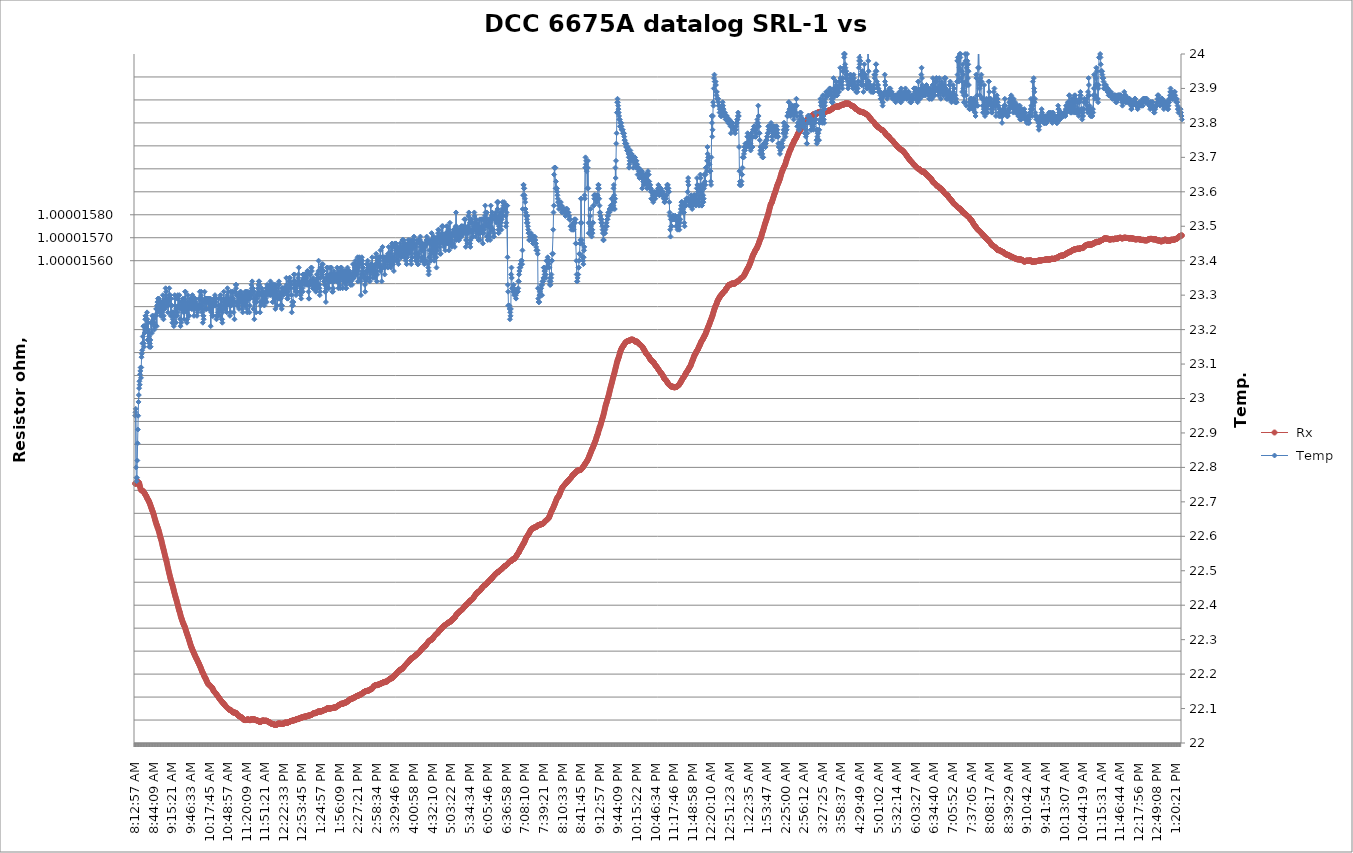
| Category |  Rx |
|---|---|
| 2021-03-12 08:12:57 | 1 |
| 2021-03-12 08:13:28 | 1 |
| 2021-03-12 08:13:58 | 1 |
| 2021-03-12 08:14:29 | 1 |
| 2021-03-12 08:15:00 | 1 |
| 2021-03-12 08:15:30 | 1 |
| 2021-03-12 08:16:01 | 1 |
| 2021-03-12 08:16:32 | 1 |
| 2021-03-12 08:17:02 | 1 |
| 2021-03-12 08:17:33 | 1 |
| 2021-03-12 08:18:04 | 1 |
| 2021-03-12 08:18:35 | 1 |
| 2021-03-12 08:19:05 | 1 |
| 2021-03-12 08:19:36 | 1 |
| 2021-03-12 08:20:07 | 1 |
| 2021-03-12 08:20:37 | 1 |
| 2021-03-12 08:21:08 | 1 |
| 2021-03-12 08:21:39 | 1 |
| 2021-03-12 08:22:09 | 1 |
| 2021-03-12 08:22:40 | 1 |
| 2021-03-12 08:23:11 | 1 |
| 2021-03-12 08:23:41 | 1 |
| 2021-03-12 08:24:12 | 1 |
| 2021-03-12 08:24:43 | 1 |
| 2021-03-12 08:25:13 | 1 |
| 2021-03-12 08:25:44 | 1 |
| 2021-03-12 08:26:15 | 1 |
| 2021-03-12 08:26:46 | 1 |
| 2021-03-12 08:27:16 | 1 |
| 2021-03-12 08:27:47 | 1 |
| 2021-03-12 08:28:18 | 1 |
| 2021-03-12 08:28:48 | 1 |
| 2021-03-12 08:29:19 | 1 |
| 2021-03-12 08:29:50 | 1 |
| 2021-03-12 08:30:20 | 1 |
| 2021-03-12 08:30:51 | 1 |
| 2021-03-12 08:31:22 | 1 |
| 2021-03-12 08:31:52 | 1 |
| 2021-03-12 08:32:23 | 1 |
| 2021-03-12 08:32:54 | 1 |
| 2021-03-12 08:33:25 | 1 |
| 2021-03-12 08:33:55 | 1 |
| 2021-03-12 08:34:26 | 1 |
| 2021-03-12 08:34:57 | 1 |
| 2021-03-12 08:35:27 | 1 |
| 2021-03-12 08:35:58 | 1 |
| 2021-03-12 08:36:29 | 1 |
| 2021-03-12 08:36:59 | 1 |
| 2021-03-12 08:37:30 | 1 |
| 2021-03-12 08:38:01 | 1 |
| 2021-03-12 08:38:31 | 1 |
| 2021-03-12 08:39:02 | 1 |
| 2021-03-12 08:39:33 | 1 |
| 2021-03-12 08:40:03 | 1 |
| 2021-03-12 08:40:34 | 1 |
| 2021-03-12 08:41:05 | 1 |
| 2021-03-12 08:41:36 | 1 |
| 2021-03-12 08:42:06 | 1 |
| 2021-03-12 08:42:37 | 1 |
| 2021-03-12 08:43:08 | 1 |
| 2021-03-12 08:43:38 | 1 |
| 2021-03-12 08:44:09 | 1 |
| 2021-03-12 08:44:40 | 1 |
| 2021-03-12 08:45:10 | 1 |
| 2021-03-12 08:45:41 | 1 |
| 2021-03-12 08:46:12 | 1 |
| 2021-03-12 08:46:42 | 1 |
| 2021-03-12 08:47:13 | 1 |
| 2021-03-12 08:47:44 | 1 |
| 2021-03-12 08:48:14 | 1 |
| 2021-03-12 08:48:45 | 1 |
| 2021-03-12 08:49:16 | 1 |
| 2021-03-12 08:49:47 | 1 |
| 2021-03-12 08:50:17 | 1 |
| 2021-03-12 08:50:48 | 1 |
| 2021-03-12 08:51:19 | 1 |
| 2021-03-12 08:51:49 | 1 |
| 2021-03-12 08:52:20 | 1 |
| 2021-03-12 08:52:51 | 1 |
| 2021-03-12 08:53:21 | 1 |
| 2021-03-12 08:53:52 | 1 |
| 2021-03-12 08:54:23 | 1 |
| 2021-03-12 08:54:53 | 1 |
| 2021-03-12 08:55:24 | 1 |
| 2021-03-12 08:55:55 | 1 |
| 2021-03-12 08:56:25 | 1 |
| 2021-03-12 08:56:56 | 1 |
| 2021-03-12 08:57:27 | 1 |
| 2021-03-12 08:57:57 | 1 |
| 2021-03-12 08:58:28 | 1 |
| 2021-03-12 08:58:59 | 1 |
| 2021-03-12 08:59:30 | 1 |
| 2021-03-12 09:00:00 | 1 |
| 2021-03-12 09:00:31 | 1 |
| 2021-03-12 09:01:02 | 1 |
| 2021-03-12 09:01:32 | 1 |
| 2021-03-12 09:02:03 | 1 |
| 2021-03-12 09:02:34 | 1 |
| 2021-03-12 09:03:04 | 1 |
| 2021-03-12 09:03:35 | 1 |
| 2021-03-12 09:04:06 | 1 |
| 2021-03-12 09:04:36 | 1 |
| 2021-03-12 09:05:07 | 1 |
| 2021-03-12 09:05:38 | 1 |
| 2021-03-12 09:06:08 | 1 |
| 2021-03-12 09:06:39 | 1 |
| 2021-03-12 09:07:10 | 1 |
| 2021-03-12 09:07:41 | 1 |
| 2021-03-12 09:08:11 | 1 |
| 2021-03-12 09:08:42 | 1 |
| 2021-03-12 09:09:13 | 1 |
| 2021-03-12 09:09:43 | 1 |
| 2021-03-12 09:10:14 | 1 |
| 2021-03-12 09:10:45 | 1 |
| 2021-03-12 09:11:15 | 1 |
| 2021-03-12 09:11:46 | 1 |
| 2021-03-12 09:12:17 | 1 |
| 2021-03-12 09:12:47 | 1 |
| 2021-03-12 09:13:18 | 1 |
| 2021-03-12 09:13:49 | 1 |
| 2021-03-12 09:14:19 | 1 |
| 2021-03-12 09:14:50 | 1 |
| 2021-03-12 09:15:21 | 1 |
| 2021-03-12 09:15:52 | 1 |
| 2021-03-12 09:16:22 | 1 |
| 2021-03-12 09:16:53 | 1 |
| 2021-03-12 09:17:24 | 1 |
| 2021-03-12 09:17:54 | 1 |
| 2021-03-12 09:18:25 | 1 |
| 2021-03-12 09:18:56 | 1 |
| 2021-03-12 09:19:26 | 1 |
| 2021-03-12 09:19:57 | 1 |
| 2021-03-12 09:20:28 | 1 |
| 2021-03-12 09:20:58 | 1 |
| 2021-03-12 09:21:29 | 1 |
| 2021-03-12 09:22:00 | 1 |
| 2021-03-12 09:22:31 | 1 |
| 2021-03-12 09:23:01 | 1 |
| 2021-03-12 09:23:32 | 1 |
| 2021-03-12 09:24:03 | 1 |
| 2021-03-12 09:24:33 | 1 |
| 2021-03-12 09:25:04 | 1 |
| 2021-03-12 09:25:35 | 1 |
| 2021-03-12 09:26:05 | 1 |
| 2021-03-12 09:26:36 | 1 |
| 2021-03-12 09:27:07 | 1 |
| 2021-03-12 09:27:37 | 1 |
| 2021-03-12 09:28:08 | 1 |
| 2021-03-12 09:28:39 | 1 |
| 2021-03-12 09:29:10 | 1 |
| 2021-03-12 09:29:40 | 1 |
| 2021-03-12 09:30:11 | 1 |
| 2021-03-12 09:30:42 | 1 |
| 2021-03-12 09:31:12 | 1 |
| 2021-03-12 09:31:43 | 1 |
| 2021-03-12 09:32:14 | 1 |
| 2021-03-12 09:32:44 | 1 |
| 2021-03-12 09:33:15 | 1 |
| 2021-03-12 09:33:46 | 1 |
| 2021-03-12 09:34:16 | 1 |
| 2021-03-12 09:34:47 | 1 |
| 2021-03-12 09:35:18 | 1 |
| 2021-03-12 09:35:49 | 1 |
| 2021-03-12 09:36:19 | 1 |
| 2021-03-12 09:36:50 | 1 |
| 2021-03-12 09:37:21 | 1 |
| 2021-03-12 09:37:51 | 1 |
| 2021-03-12 09:38:22 | 1 |
| 2021-03-12 09:38:53 | 1 |
| 2021-03-12 09:39:23 | 1 |
| 2021-03-12 09:39:54 | 1 |
| 2021-03-12 09:40:25 | 1 |
| 2021-03-12 09:40:55 | 1 |
| 2021-03-12 09:41:26 | 1 |
| 2021-03-12 09:41:57 | 1 |
| 2021-03-12 09:42:27 | 1 |
| 2021-03-12 09:42:58 | 1 |
| 2021-03-12 09:43:29 | 1 |
| 2021-03-12 09:44:00 | 1 |
| 2021-03-12 09:44:30 | 1 |
| 2021-03-12 09:45:01 | 1 |
| 2021-03-12 09:45:32 | 1 |
| 2021-03-12 09:46:02 | 1 |
| 2021-03-12 09:46:33 | 1 |
| 2021-03-12 09:47:04 | 1 |
| 2021-03-12 09:47:34 | 1 |
| 2021-03-12 09:48:05 | 1 |
| 2021-03-12 09:48:36 | 1 |
| 2021-03-12 09:49:06 | 1 |
| 2021-03-12 09:49:37 | 1 |
| 2021-03-12 09:50:08 | 1 |
| 2021-03-12 09:50:38 | 1 |
| 2021-03-12 09:51:09 | 1 |
| 2021-03-12 09:51:40 | 1 |
| 2021-03-12 09:52:11 | 1 |
| 2021-03-12 09:52:41 | 1 |
| 2021-03-12 09:53:12 | 1 |
| 2021-03-12 09:53:43 | 1 |
| 2021-03-12 09:54:13 | 1 |
| 2021-03-12 09:54:44 | 1 |
| 2021-03-12 09:55:15 | 1 |
| 2021-03-12 09:55:45 | 1 |
| 2021-03-12 09:56:16 | 1 |
| 2021-03-12 09:56:47 | 1 |
| 2021-03-12 09:57:17 | 1 |
| 2021-03-12 09:57:48 | 1 |
| 2021-03-12 09:58:19 | 1 |
| 2021-03-12 09:58:49 | 1 |
| 2021-03-12 09:59:20 | 1 |
| 2021-03-12 09:59:51 | 1 |
| 2021-03-12 10:00:22 | 1 |
| 2021-03-12 10:00:52 | 1 |
| 2021-03-12 10:01:23 | 1 |
| 2021-03-12 10:01:54 | 1 |
| 2021-03-12 10:02:24 | 1 |
| 2021-03-12 10:02:55 | 1 |
| 2021-03-12 10:03:26 | 1 |
| 2021-03-12 10:03:56 | 1 |
| 2021-03-12 10:04:27 | 1 |
| 2021-03-12 10:04:58 | 1 |
| 2021-03-12 10:05:28 | 1 |
| 2021-03-12 10:05:59 | 1 |
| 2021-03-12 10:06:30 | 1 |
| 2021-03-12 10:07:00 | 1 |
| 2021-03-12 10:07:31 | 1 |
| 2021-03-12 10:08:02 | 1 |
| 2021-03-12 10:08:33 | 1 |
| 2021-03-12 10:09:03 | 1 |
| 2021-03-12 10:09:34 | 1 |
| 2021-03-12 10:10:05 | 1 |
| 2021-03-12 10:10:35 | 1 |
| 2021-03-12 10:11:06 | 1 |
| 2021-03-12 10:11:37 | 1 |
| 2021-03-12 10:12:07 | 1 |
| 2021-03-12 10:12:38 | 1 |
| 2021-03-12 10:13:09 | 1 |
| 2021-03-12 10:13:39 | 1 |
| 2021-03-12 10:14:10 | 1 |
| 2021-03-12 10:14:41 | 1 |
| 2021-03-12 10:15:12 | 1 |
| 2021-03-12 10:15:42 | 1 |
| 2021-03-12 10:16:13 | 1 |
| 2021-03-12 10:16:44 | 1 |
| 2021-03-12 10:17:14 | 1 |
| 2021-03-12 10:17:45 | 1 |
| 2021-03-12 10:18:16 | 1 |
| 2021-03-12 10:18:46 | 1 |
| 2021-03-12 10:19:17 | 1 |
| 2021-03-12 10:19:48 | 1 |
| 2021-03-12 10:20:18 | 1 |
| 2021-03-12 10:20:49 | 1 |
| 2021-03-12 10:21:20 | 1 |
| 2021-03-12 10:21:51 | 1 |
| 2021-03-12 10:22:21 | 1 |
| 2021-03-12 10:22:52 | 1 |
| 2021-03-12 10:23:23 | 1 |
| 2021-03-12 10:23:53 | 1 |
| 2021-03-12 10:24:24 | 1 |
| 2021-03-12 10:24:55 | 1 |
| 2021-03-12 10:25:25 | 1 |
| 2021-03-12 10:25:56 | 1 |
| 2021-03-12 10:26:27 | 1 |
| 2021-03-12 10:26:57 | 1 |
| 2021-03-12 10:27:28 | 1 |
| 2021-03-12 10:27:59 | 1 |
| 2021-03-12 10:28:29 | 1 |
| 2021-03-12 10:29:00 | 1 |
| 2021-03-12 10:29:31 | 1 |
| 2021-03-12 10:30:02 | 1 |
| 2021-03-12 10:30:32 | 1 |
| 2021-03-12 10:31:03 | 1 |
| 2021-03-12 10:31:34 | 1 |
| 2021-03-12 10:32:04 | 1 |
| 2021-03-12 10:32:35 | 1 |
| 2021-03-12 10:33:06 | 1 |
| 2021-03-12 10:33:36 | 1 |
| 2021-03-12 10:34:07 | 1 |
| 2021-03-12 10:34:38 | 1 |
| 2021-03-12 10:35:08 | 1 |
| 2021-03-12 10:35:39 | 1 |
| 2021-03-12 10:36:10 | 1 |
| 2021-03-12 10:36:41 | 1 |
| 2021-03-12 10:37:11 | 1 |
| 2021-03-12 10:37:42 | 1 |
| 2021-03-12 10:38:13 | 1 |
| 2021-03-12 10:38:43 | 1 |
| 2021-03-12 10:39:14 | 1 |
| 2021-03-12 10:39:45 | 1 |
| 2021-03-12 10:40:15 | 1 |
| 2021-03-12 10:40:46 | 1 |
| 2021-03-12 10:41:17 | 1 |
| 2021-03-12 10:41:47 | 1 |
| 2021-03-12 10:42:18 | 1 |
| 2021-03-12 10:42:49 | 1 |
| 2021-03-12 10:43:19 | 1 |
| 2021-03-12 10:43:50 | 1 |
| 2021-03-12 10:44:21 | 1 |
| 2021-03-12 10:44:52 | 1 |
| 2021-03-12 10:45:22 | 1 |
| 2021-03-12 10:45:53 | 1 |
| 2021-03-12 10:46:24 | 1 |
| 2021-03-12 10:46:54 | 1 |
| 2021-03-12 10:47:25 | 1 |
| 2021-03-12 10:47:56 | 1 |
| 2021-03-12 10:48:26 | 1 |
| 2021-03-12 10:48:57 | 1 |
| 2021-03-12 10:49:28 | 1 |
| 2021-03-12 10:49:58 | 1 |
| 2021-03-12 10:50:29 | 1 |
| 2021-03-12 10:51:00 | 1 |
| 2021-03-12 10:51:30 | 1 |
| 2021-03-12 10:52:01 | 1 |
| 2021-03-12 10:52:32 | 1 |
| 2021-03-12 10:53:03 | 1 |
| 2021-03-12 10:53:33 | 1 |
| 2021-03-12 10:54:04 | 1 |
| 2021-03-12 10:54:35 | 1 |
| 2021-03-12 10:55:05 | 1 |
| 2021-03-12 10:55:36 | 1 |
| 2021-03-12 10:56:07 | 1 |
| 2021-03-12 10:56:37 | 1 |
| 2021-03-12 10:57:08 | 1 |
| 2021-03-12 10:57:39 | 1 |
| 2021-03-12 10:58:09 | 1 |
| 2021-03-12 10:58:40 | 1 |
| 2021-03-12 10:59:11 | 1 |
| 2021-03-12 10:59:41 | 1 |
| 2021-03-12 11:00:12 | 1 |
| 2021-03-12 11:00:43 | 1 |
| 2021-03-12 11:01:14 | 1 |
| 2021-03-12 11:01:44 | 1 |
| 2021-03-12 11:02:15 | 1 |
| 2021-03-12 11:02:46 | 1 |
| 2021-03-12 11:03:16 | 1 |
| 2021-03-12 11:03:47 | 1 |
| 2021-03-12 11:04:18 | 1 |
| 2021-03-12 11:04:48 | 1 |
| 2021-03-12 11:05:19 | 1 |
| 2021-03-12 11:05:50 | 1 |
| 2021-03-12 11:06:20 | 1 |
| 2021-03-12 11:06:51 | 1 |
| 2021-03-12 11:07:22 | 1 |
| 2021-03-12 11:07:53 | 1 |
| 2021-03-12 11:08:23 | 1 |
| 2021-03-12 11:08:54 | 1 |
| 2021-03-12 11:09:25 | 1 |
| 2021-03-12 11:09:55 | 1 |
| 2021-03-12 11:10:26 | 1 |
| 2021-03-12 11:10:57 | 1 |
| 2021-03-12 11:11:27 | 1 |
| 2021-03-12 11:11:58 | 1 |
| 2021-03-12 11:12:29 | 1 |
| 2021-03-12 11:12:59 | 1 |
| 2021-03-12 11:13:30 | 1 |
| 2021-03-12 11:14:01 | 1 |
| 2021-03-12 11:14:32 | 1 |
| 2021-03-12 11:15:02 | 1 |
| 2021-03-12 11:15:33 | 1 |
| 2021-03-12 11:16:04 | 1 |
| 2021-03-12 11:16:34 | 1 |
| 2021-03-12 11:17:05 | 1 |
| 2021-03-12 11:17:36 | 1 |
| 2021-03-12 11:18:06 | 1 |
| 2021-03-12 11:18:37 | 1 |
| 2021-03-12 11:19:08 | 1 |
| 2021-03-12 11:19:38 | 1 |
| 2021-03-12 11:20:09 | 1 |
| 2021-03-12 11:20:40 | 1 |
| 2021-03-12 11:21:10 | 1 |
| 2021-03-12 11:21:41 | 1 |
| 2021-03-12 11:22:12 | 1 |
| 2021-03-12 11:22:43 | 1 |
| 2021-03-12 11:23:13 | 1 |
| 2021-03-12 11:23:44 | 1 |
| 2021-03-12 11:24:15 | 1 |
| 2021-03-12 11:24:45 | 1 |
| 2021-03-12 11:25:16 | 1 |
| 2021-03-12 11:25:47 | 1 |
| 2021-03-12 11:26:17 | 1 |
| 2021-03-12 11:26:48 | 1 |
| 2021-03-12 11:27:19 | 1 |
| 2021-03-12 11:27:49 | 1 |
| 2021-03-12 11:28:20 | 1 |
| 2021-03-12 11:28:51 | 1 |
| 2021-03-12 11:29:21 | 1 |
| 2021-03-12 11:29:52 | 1 |
| 2021-03-12 11:30:23 | 1 |
| 2021-03-12 11:30:54 | 1 |
| 2021-03-12 11:31:24 | 1 |
| 2021-03-12 11:31:55 | 1 |
| 2021-03-12 11:32:26 | 1 |
| 2021-03-12 11:32:56 | 1 |
| 2021-03-12 11:33:27 | 1 |
| 2021-03-12 11:33:58 | 1 |
| 2021-03-12 11:34:28 | 1 |
| 2021-03-12 11:34:59 | 1 |
| 2021-03-12 11:35:30 | 1 |
| 2021-03-12 11:36:00 | 1 |
| 2021-03-12 11:36:31 | 1 |
| 2021-03-12 11:37:02 | 1 |
| 2021-03-12 11:37:33 | 1 |
| 2021-03-12 11:38:03 | 1 |
| 2021-03-12 11:38:34 | 1 |
| 2021-03-12 11:39:05 | 1 |
| 2021-03-12 11:39:35 | 1 |
| 2021-03-12 11:40:06 | 1 |
| 2021-03-12 11:40:37 | 1 |
| 2021-03-12 11:41:07 | 1 |
| 2021-03-12 11:41:38 | 1 |
| 2021-03-12 11:42:09 | 1 |
| 2021-03-12 11:42:39 | 1 |
| 2021-03-12 11:43:10 | 1 |
| 2021-03-12 11:43:41 | 1 |
| 2021-03-12 11:44:11 | 1 |
| 2021-03-12 11:44:42 | 1 |
| 2021-03-12 11:45:13 | 1 |
| 2021-03-12 11:45:44 | 1 |
| 2021-03-12 11:46:14 | 1 |
| 2021-03-12 11:46:45 | 1 |
| 2021-03-12 11:47:16 | 1 |
| 2021-03-12 11:47:46 | 1 |
| 2021-03-12 11:48:17 | 1 |
| 2021-03-12 11:48:48 | 1 |
| 2021-03-12 11:49:18 | 1 |
| 2021-03-12 11:49:49 | 1 |
| 2021-03-12 11:50:20 | 1 |
| 2021-03-12 11:50:50 | 1 |
| 2021-03-12 11:51:21 | 1 |
| 2021-03-12 11:51:52 | 1 |
| 2021-03-12 11:52:23 | 1 |
| 2021-03-12 11:52:53 | 1 |
| 2021-03-12 11:53:24 | 1 |
| 2021-03-12 11:53:55 | 1 |
| 2021-03-12 11:54:25 | 1 |
| 2021-03-12 11:54:56 | 1 |
| 2021-03-12 11:55:27 | 1 |
| 2021-03-12 11:55:57 | 1 |
| 2021-03-12 11:56:28 | 1 |
| 2021-03-12 11:56:59 | 1 |
| 2021-03-12 11:57:29 | 1 |
| 2021-03-12 11:58:00 | 1 |
| 2021-03-12 11:58:31 | 1 |
| 2021-03-12 11:59:01 | 1 |
| 2021-03-12 11:59:32 | 1 |
| 2021-03-12 12:00:03 | 1 |
| 2021-03-12 12:00:34 | 1 |
| 2021-03-12 12:01:04 | 1 |
| 2021-03-12 12:01:35 | 1 |
| 2021-03-12 12:02:06 | 1 |
| 2021-03-12 12:02:36 | 1 |
| 2021-03-12 12:03:07 | 1 |
| 2021-03-12 12:03:38 | 1 |
| 2021-03-12 12:04:08 | 1 |
| 2021-03-12 12:04:39 | 1 |
| 2021-03-12 12:05:10 | 1 |
| 2021-03-12 12:05:40 | 1 |
| 2021-03-12 12:06:11 | 1 |
| 2021-03-12 12:06:42 | 1 |
| 2021-03-12 12:07:13 | 1 |
| 2021-03-12 12:07:43 | 1 |
| 2021-03-12 12:08:14 | 1 |
| 2021-03-12 12:08:45 | 1 |
| 2021-03-12 12:09:15 | 1 |
| 2021-03-12 12:09:46 | 1 |
| 2021-03-12 12:10:17 | 1 |
| 2021-03-12 12:10:47 | 1 |
| 2021-03-12 12:11:18 | 1 |
| 2021-03-12 12:11:49 | 1 |
| 2021-03-12 12:12:19 | 1 |
| 2021-03-12 12:12:50 | 1 |
| 2021-03-12 12:13:21 | 1 |
| 2021-03-12 12:13:51 | 1 |
| 2021-03-12 12:14:22 | 1 |
| 2021-03-12 12:14:53 | 1 |
| 2021-03-12 12:15:24 | 1 |
| 2021-03-12 12:15:54 | 1 |
| 2021-03-12 12:16:25 | 1 |
| 2021-03-12 12:16:56 | 1 |
| 2021-03-12 12:17:26 | 1 |
| 2021-03-12 12:17:57 | 1 |
| 2021-03-12 12:18:28 | 1 |
| 2021-03-12 12:18:58 | 1 |
| 2021-03-12 12:19:29 | 1 |
| 2021-03-12 12:20:00 | 1 |
| 2021-03-12 12:20:30 | 1 |
| 2021-03-12 12:21:01 | 1 |
| 2021-03-12 12:21:32 | 1 |
| 2021-03-12 12:22:02 | 1 |
| 2021-03-12 12:22:33 | 1 |
| 2021-03-12 12:23:04 | 1 |
| 2021-03-12 12:23:35 | 1 |
| 2021-03-12 12:24:05 | 1 |
| 2021-03-12 12:24:36 | 1 |
| 2021-03-12 12:25:07 | 1 |
| 2021-03-12 12:25:37 | 1 |
| 2021-03-12 12:26:08 | 1 |
| 2021-03-12 12:26:39 | 1 |
| 2021-03-12 12:27:09 | 1 |
| 2021-03-12 12:27:40 | 1 |
| 2021-03-12 12:28:11 | 1 |
| 2021-03-12 12:28:41 | 1 |
| 2021-03-12 12:29:12 | 1 |
| 2021-03-12 12:29:43 | 1 |
| 2021-03-12 12:30:14 | 1 |
| 2021-03-12 12:30:44 | 1 |
| 2021-03-12 12:31:15 | 1 |
| 2021-03-12 12:31:46 | 1 |
| 2021-03-12 12:32:16 | 1 |
| 2021-03-12 12:32:47 | 1 |
| 2021-03-12 12:33:18 | 1 |
| 2021-03-12 12:33:48 | 1 |
| 2021-03-12 12:34:19 | 1 |
| 2021-03-12 12:34:50 | 1 |
| 2021-03-12 12:35:20 | 1 |
| 2021-03-12 12:35:51 | 1 |
| 2021-03-12 12:36:22 | 1 |
| 2021-03-12 12:36:53 | 1 |
| 2021-03-12 12:37:23 | 1 |
| 2021-03-12 12:37:54 | 1 |
| 2021-03-12 12:38:25 | 1 |
| 2021-03-12 12:38:55 | 1 |
| 2021-03-12 12:39:26 | 1 |
| 2021-03-12 12:39:57 | 1 |
| 2021-03-12 12:40:27 | 1 |
| 2021-03-12 12:40:58 | 1 |
| 2021-03-12 12:41:29 | 1 |
| 2021-03-12 12:41:59 | 1 |
| 2021-03-12 12:42:30 | 1 |
| 2021-03-12 12:43:01 | 1 |
| 2021-03-12 12:43:31 | 1 |
| 2021-03-12 12:44:02 | 1 |
| 2021-03-12 12:44:33 | 1 |
| 2021-03-12 12:45:04 | 1 |
| 2021-03-12 12:45:34 | 1 |
| 2021-03-12 12:46:05 | 1 |
| 2021-03-12 12:46:36 | 1 |
| 2021-03-12 12:47:06 | 1 |
| 2021-03-12 12:47:37 | 1 |
| 2021-03-12 12:48:08 | 1 |
| 2021-03-12 12:48:38 | 1 |
| 2021-03-12 12:49:09 | 1 |
| 2021-03-12 12:49:40 | 1 |
| 2021-03-12 12:50:10 | 1 |
| 2021-03-12 12:50:41 | 1 |
| 2021-03-12 12:51:12 | 1 |
| 2021-03-12 12:51:43 | 1 |
| 2021-03-12 12:52:13 | 1 |
| 2021-03-12 12:52:44 | 1 |
| 2021-03-12 12:53:15 | 1 |
| 2021-03-12 12:53:45 | 1 |
| 2021-03-12 12:54:16 | 1 |
| 2021-03-12 12:54:47 | 1 |
| 2021-03-12 12:55:17 | 1 |
| 2021-03-12 12:55:48 | 1 |
| 2021-03-12 12:56:19 | 1 |
| 2021-03-12 12:56:49 | 1 |
| 2021-03-12 12:57:20 | 1 |
| 2021-03-12 12:57:51 | 1 |
| 2021-03-12 12:58:21 | 1 |
| 2021-03-12 12:58:52 | 1 |
| 2021-03-12 12:59:23 | 1 |
| 2021-03-12 12:59:54 | 1 |
| 2021-03-12 13:00:24 | 1 |
| 2021-03-12 13:00:55 | 1 |
| 2021-03-12 13:01:26 | 1 |
| 2021-03-12 13:01:56 | 1 |
| 2021-03-12 13:02:27 | 1 |
| 2021-03-12 13:02:58 | 1 |
| 2021-03-12 13:03:28 | 1 |
| 2021-03-12 13:03:59 | 1 |
| 2021-03-12 13:04:30 | 1 |
| 2021-03-12 13:05:00 | 1 |
| 2021-03-12 13:05:31 | 1 |
| 2021-03-12 13:06:02 | 1 |
| 2021-03-12 13:06:33 | 1 |
| 2021-03-12 13:07:03 | 1 |
| 2021-03-12 13:07:34 | 1 |
| 2021-03-12 13:08:05 | 1 |
| 2021-03-12 13:08:35 | 1 |
| 2021-03-12 13:09:06 | 1 |
| 2021-03-12 13:09:37 | 1 |
| 2021-03-12 13:10:07 | 1 |
| 2021-03-12 13:10:38 | 1 |
| 2021-03-12 13:11:09 | 1 |
| 2021-03-12 13:11:39 | 1 |
| 2021-03-12 13:12:10 | 1 |
| 2021-03-12 13:12:41 | 1 |
| 2021-03-12 13:13:12 | 1 |
| 2021-03-12 13:13:42 | 1 |
| 2021-03-12 13:14:13 | 1 |
| 2021-03-12 13:14:44 | 1 |
| 2021-03-12 13:15:14 | 1 |
| 2021-03-12 13:15:45 | 1 |
| 2021-03-12 13:16:16 | 1 |
| 2021-03-12 13:16:46 | 1 |
| 2021-03-12 13:17:17 | 1 |
| 2021-03-12 13:17:48 | 1 |
| 2021-03-12 13:18:18 | 1 |
| 2021-03-12 13:18:49 | 1 |
| 2021-03-12 13:19:20 | 1 |
| 2021-03-12 13:19:50 | 1 |
| 2021-03-12 13:20:21 | 1 |
| 2021-03-12 13:20:52 | 1 |
| 2021-03-12 13:21:23 | 1 |
| 2021-03-12 13:21:53 | 1 |
| 2021-03-12 13:22:24 | 1 |
| 2021-03-12 13:22:55 | 1 |
| 2021-03-12 13:23:25 | 1 |
| 2021-03-12 13:23:56 | 1 |
| 2021-03-12 13:24:27 | 1 |
| 2021-03-12 13:24:57 | 1 |
| 2021-03-12 13:25:28 | 1 |
| 2021-03-12 13:25:59 | 1 |
| 2021-03-12 13:26:29 | 1 |
| 2021-03-12 13:27:00 | 1 |
| 2021-03-12 13:27:31 | 1 |
| 2021-03-12 13:28:02 | 1 |
| 2021-03-12 13:28:32 | 1 |
| 2021-03-12 13:29:03 | 1 |
| 2021-03-12 13:29:34 | 1 |
| 2021-03-12 13:30:04 | 1 |
| 2021-03-12 13:30:35 | 1 |
| 2021-03-12 13:31:06 | 1 |
| 2021-03-12 13:31:36 | 1 |
| 2021-03-12 13:32:07 | 1 |
| 2021-03-12 13:32:38 | 1 |
| 2021-03-12 13:33:08 | 1 |
| 2021-03-12 13:33:39 | 1 |
| 2021-03-12 13:34:10 | 1 |
| 2021-03-12 13:34:40 | 1 |
| 2021-03-12 13:35:11 | 1 |
| 2021-03-12 13:35:42 | 1 |
| 2021-03-12 13:36:13 | 1 |
| 2021-03-12 13:36:43 | 1 |
| 2021-03-12 13:37:14 | 1 |
| 2021-03-12 13:37:45 | 1 |
| 2021-03-12 13:38:15 | 1 |
| 2021-03-12 13:38:46 | 1 |
| 2021-03-12 13:39:17 | 1 |
| 2021-03-12 13:39:47 | 1 |
| 2021-03-12 13:40:18 | 1 |
| 2021-03-12 13:40:49 | 1 |
| 2021-03-12 13:41:19 | 1 |
| 2021-03-12 13:41:50 | 1 |
| 2021-03-12 13:42:21 | 1 |
| 2021-03-12 13:42:52 | 1 |
| 2021-03-12 13:43:22 | 1 |
| 2021-03-12 13:43:53 | 1 |
| 2021-03-12 13:44:24 | 1 |
| 2021-03-12 13:44:54 | 1 |
| 2021-03-12 13:45:25 | 1 |
| 2021-03-12 13:45:56 | 1 |
| 2021-03-12 13:46:26 | 1 |
| 2021-03-12 13:46:57 | 1 |
| 2021-03-12 13:47:28 | 1 |
| 2021-03-12 13:47:58 | 1 |
| 2021-03-12 13:48:29 | 1 |
| 2021-03-12 13:49:00 | 1 |
| 2021-03-12 13:49:30 | 1 |
| 2021-03-12 13:50:01 | 1 |
| 2021-03-12 13:50:32 | 1 |
| 2021-03-12 13:51:03 | 1 |
| 2021-03-12 13:51:33 | 1 |
| 2021-03-12 13:52:04 | 1 |
| 2021-03-12 13:52:35 | 1 |
| 2021-03-12 13:53:05 | 1 |
| 2021-03-12 13:53:36 | 1 |
| 2021-03-12 13:54:07 | 1 |
| 2021-03-12 13:54:37 | 1 |
| 2021-03-12 13:55:08 | 1 |
| 2021-03-12 13:55:39 | 1 |
| 2021-03-12 13:56:09 | 1 |
| 2021-03-12 13:56:40 | 1 |
| 2021-03-12 13:57:11 | 1 |
| 2021-03-12 13:57:42 | 1 |
| 2021-03-12 13:58:12 | 1 |
| 2021-03-12 13:58:43 | 1 |
| 2021-03-12 13:59:14 | 1 |
| 2021-03-12 13:59:44 | 1 |
| 2021-03-12 14:00:15 | 1 |
| 2021-03-12 14:00:46 | 1 |
| 2021-03-12 14:01:16 | 1 |
| 2021-03-12 14:01:47 | 1 |
| 2021-03-12 14:02:18 | 1 |
| 2021-03-12 14:02:48 | 1 |
| 2021-03-12 14:03:19 | 1 |
| 2021-03-12 14:03:50 | 1 |
| 2021-03-12 14:04:20 | 1 |
| 2021-03-12 14:04:51 | 1 |
| 2021-03-12 14:05:22 | 1 |
| 2021-03-12 14:05:53 | 1 |
| 2021-03-12 14:06:23 | 1 |
| 2021-03-12 14:06:54 | 1 |
| 2021-03-12 14:07:25 | 1 |
| 2021-03-12 14:07:55 | 1 |
| 2021-03-12 14:08:26 | 1 |
| 2021-03-12 14:08:57 | 1 |
| 2021-03-12 14:09:27 | 1 |
| 2021-03-12 14:09:58 | 1 |
| 2021-03-12 14:10:29 | 1 |
| 2021-03-12 14:10:59 | 1 |
| 2021-03-12 14:11:30 | 1 |
| 2021-03-12 14:12:01 | 1 |
| 2021-03-12 14:12:32 | 1 |
| 2021-03-12 14:13:02 | 1 |
| 2021-03-12 14:13:33 | 1 |
| 2021-03-12 14:14:04 | 1 |
| 2021-03-12 14:14:34 | 1 |
| 2021-03-12 14:15:05 | 1 |
| 2021-03-12 14:15:36 | 1 |
| 2021-03-12 14:16:06 | 1 |
| 2021-03-12 14:16:37 | 1 |
| 2021-03-12 14:17:08 | 1 |
| 2021-03-12 14:17:38 | 1 |
| 2021-03-12 14:18:09 | 1 |
| 2021-03-12 14:18:40 | 1 |
| 2021-03-12 14:19:10 | 1 |
| 2021-03-12 14:19:41 | 1 |
| 2021-03-12 14:20:12 | 1 |
| 2021-03-12 14:20:43 | 1 |
| 2021-03-12 14:21:13 | 1 |
| 2021-03-12 14:21:44 | 1 |
| 2021-03-12 14:22:15 | 1 |
| 2021-03-12 14:22:45 | 1 |
| 2021-03-12 14:23:16 | 1 |
| 2021-03-12 14:23:47 | 1 |
| 2021-03-12 14:24:17 | 1 |
| 2021-03-12 14:24:48 | 1 |
| 2021-03-12 14:25:19 | 1 |
| 2021-03-12 14:25:49 | 1 |
| 2021-03-12 14:26:20 | 1 |
| 2021-03-12 14:26:51 | 1 |
| 2021-03-12 14:27:21 | 1 |
| 2021-03-12 14:27:52 | 1 |
| 2021-03-12 14:28:23 | 1 |
| 2021-03-12 14:28:54 | 1 |
| 2021-03-12 14:29:24 | 1 |
| 2021-03-12 14:29:55 | 1 |
| 2021-03-12 14:30:26 | 1 |
| 2021-03-12 14:30:56 | 1 |
| 2021-03-12 14:31:27 | 1 |
| 2021-03-12 14:31:58 | 1 |
| 2021-03-12 14:32:28 | 1 |
| 2021-03-12 14:32:59 | 1 |
| 2021-03-12 14:33:30 | 1 |
| 2021-03-12 14:34:00 | 1 |
| 2021-03-12 14:34:31 | 1 |
| 2021-03-12 14:35:02 | 1 |
| 2021-03-12 14:35:32 | 1 |
| 2021-03-12 14:36:03 | 1 |
| 2021-03-12 14:36:34 | 1 |
| 2021-03-12 14:37:05 | 1 |
| 2021-03-12 14:37:35 | 1 |
| 2021-03-12 14:38:06 | 1 |
| 2021-03-12 14:38:37 | 1 |
| 2021-03-12 14:39:07 | 1 |
| 2021-03-12 14:39:38 | 1 |
| 2021-03-12 14:40:09 | 1 |
| 2021-03-12 14:40:39 | 1 |
| 2021-03-12 14:41:10 | 1 |
| 2021-03-12 14:41:41 | 1 |
| 2021-03-12 14:42:11 | 1 |
| 2021-03-12 14:42:42 | 1 |
| 2021-03-12 14:43:13 | 1 |
| 2021-03-12 14:43:44 | 1 |
| 2021-03-12 14:44:14 | 1 |
| 2021-03-12 14:44:45 | 1 |
| 2021-03-12 14:45:16 | 1 |
| 2021-03-12 14:45:46 | 1 |
| 2021-03-12 14:46:17 | 1 |
| 2021-03-12 14:46:48 | 1 |
| 2021-03-12 14:47:18 | 1 |
| 2021-03-12 14:47:49 | 1 |
| 2021-03-12 14:48:20 | 1 |
| 2021-03-12 14:48:50 | 1 |
| 2021-03-12 14:49:21 | 1 |
| 2021-03-12 14:49:52 | 1 |
| 2021-03-12 14:50:22 | 1 |
| 2021-03-12 14:50:53 | 1 |
| 2021-03-12 14:51:24 | 1 |
| 2021-03-12 14:51:55 | 1 |
| 2021-03-12 14:52:25 | 1 |
| 2021-03-12 14:52:56 | 1 |
| 2021-03-12 14:53:27 | 1 |
| 2021-03-12 14:53:57 | 1 |
| 2021-03-12 14:54:28 | 1 |
| 2021-03-12 14:54:59 | 1 |
| 2021-03-12 14:55:29 | 1 |
| 2021-03-12 14:56:00 | 1 |
| 2021-03-12 14:56:31 | 1 |
| 2021-03-12 14:57:01 | 1 |
| 2021-03-12 14:57:32 | 1 |
| 2021-03-12 14:58:03 | 1 |
| 2021-03-12 14:58:34 | 1 |
| 2021-03-12 14:59:04 | 1 |
| 2021-03-12 14:59:35 | 1 |
| 2021-03-12 15:00:06 | 1 |
| 2021-03-12 15:00:36 | 1 |
| 2021-03-12 15:01:07 | 1 |
| 2021-03-12 15:01:38 | 1 |
| 2021-03-12 15:02:08 | 1 |
| 2021-03-12 15:02:39 | 1 |
| 2021-03-12 15:03:10 | 1 |
| 2021-03-12 15:03:40 | 1 |
| 2021-03-12 15:04:11 | 1 |
| 2021-03-12 15:04:42 | 1 |
| 2021-03-12 15:05:12 | 1 |
| 2021-03-12 15:05:43 | 1 |
| 2021-03-12 15:06:14 | 1 |
| 2021-03-12 15:06:45 | 1 |
| 2021-03-12 15:07:15 | 1 |
| 2021-03-12 15:07:46 | 1 |
| 2021-03-12 15:08:17 | 1 |
| 2021-03-12 15:08:47 | 1 |
| 2021-03-12 15:09:18 | 1 |
| 2021-03-12 15:09:49 | 1 |
| 2021-03-12 15:10:19 | 1 |
| 2021-03-12 15:10:50 | 1 |
| 2021-03-12 15:11:21 | 1 |
| 2021-03-12 15:11:51 | 1 |
| 2021-03-12 15:12:22 | 1 |
| 2021-03-12 15:12:53 | 1 |
| 2021-03-12 15:13:24 | 1 |
| 2021-03-12 15:13:54 | 1 |
| 2021-03-12 15:14:25 | 1 |
| 2021-03-12 15:14:56 | 1 |
| 2021-03-12 15:15:26 | 1 |
| 2021-03-12 15:15:57 | 1 |
| 2021-03-12 15:16:28 | 1 |
| 2021-03-12 15:16:58 | 1 |
| 2021-03-12 15:17:29 | 1 |
| 2021-03-12 15:18:00 | 1 |
| 2021-03-12 15:18:30 | 1 |
| 2021-03-12 15:19:01 | 1 |
| 2021-03-12 15:19:32 | 1 |
| 2021-03-12 15:20:03 | 1 |
| 2021-03-12 15:20:33 | 1 |
| 2021-03-12 15:21:04 | 1 |
| 2021-03-12 15:21:35 | 1 |
| 2021-03-12 15:22:05 | 1 |
| 2021-03-12 15:22:36 | 1 |
| 2021-03-12 15:23:07 | 1 |
| 2021-03-12 15:23:37 | 1 |
| 2021-03-12 15:24:08 | 1 |
| 2021-03-12 15:24:39 | 1 |
| 2021-03-12 15:25:09 | 1 |
| 2021-03-12 15:25:40 | 1 |
| 2021-03-12 15:26:11 | 1 |
| 2021-03-12 15:26:41 | 1 |
| 2021-03-12 15:27:12 | 1 |
| 2021-03-12 15:27:43 | 1 |
| 2021-03-12 15:28:14 | 1 |
| 2021-03-12 15:28:44 | 1 |
| 2021-03-12 15:29:15 | 1 |
| 2021-03-12 15:29:46 | 1 |
| 2021-03-12 15:30:16 | 1 |
| 2021-03-12 15:30:47 | 1 |
| 2021-03-12 15:31:18 | 1 |
| 2021-03-12 15:31:48 | 1 |
| 2021-03-12 15:32:19 | 1 |
| 2021-03-12 15:32:50 | 1 |
| 2021-03-12 15:33:20 | 1 |
| 2021-03-12 15:33:51 | 1 |
| 2021-03-12 15:34:22 | 1 |
| 2021-03-12 15:34:53 | 1 |
| 2021-03-12 15:35:23 | 1 |
| 2021-03-12 15:35:54 | 1 |
| 2021-03-12 15:36:25 | 1 |
| 2021-03-12 15:36:55 | 1 |
| 2021-03-12 15:37:26 | 1 |
| 2021-03-12 15:37:57 | 1 |
| 2021-03-12 15:38:27 | 1 |
| 2021-03-12 15:38:58 | 1 |
| 2021-03-12 15:39:29 | 1 |
| 2021-03-12 15:39:59 | 1 |
| 2021-03-12 15:40:30 | 1 |
| 2021-03-12 15:41:01 | 1 |
| 2021-03-12 15:41:31 | 1 |
| 2021-03-12 15:42:02 | 1 |
| 2021-03-12 15:42:33 | 1 |
| 2021-03-12 15:43:04 | 1 |
| 2021-03-12 15:43:34 | 1 |
| 2021-03-12 15:44:05 | 1 |
| 2021-03-12 15:44:36 | 1 |
| 2021-03-12 15:45:06 | 1 |
| 2021-03-12 15:45:37 | 1 |
| 2021-03-12 15:46:08 | 1 |
| 2021-03-12 15:46:38 | 1 |
| 2021-03-12 15:47:09 | 1 |
| 2021-03-12 15:47:40 | 1 |
| 2021-03-12 15:48:10 | 1 |
| 2021-03-12 15:48:41 | 1 |
| 2021-03-12 15:49:12 | 1 |
| 2021-03-12 15:49:43 | 1 |
| 2021-03-12 15:50:13 | 1 |
| 2021-03-12 15:50:44 | 1 |
| 2021-03-12 15:51:15 | 1 |
| 2021-03-12 15:51:45 | 1 |
| 2021-03-12 15:52:16 | 1 |
| 2021-03-12 15:52:47 | 1 |
| 2021-03-12 15:53:17 | 1 |
| 2021-03-12 15:53:48 | 1 |
| 2021-03-12 15:54:19 | 1 |
| 2021-03-12 15:54:49 | 1 |
| 2021-03-12 15:55:20 | 1 |
| 2021-03-12 15:55:51 | 1 |
| 2021-03-12 15:56:21 | 1 |
| 2021-03-12 15:56:52 | 1 |
| 2021-03-12 15:57:23 | 1 |
| 2021-03-12 15:57:54 | 1 |
| 2021-03-12 15:58:24 | 1 |
| 2021-03-12 15:58:55 | 1 |
| 2021-03-12 15:59:26 | 1 |
| 2021-03-12 15:59:56 | 1 |
| 2021-03-12 16:00:27 | 1 |
| 2021-03-12 16:00:58 | 1 |
| 2021-03-12 16:01:28 | 1 |
| 2021-03-12 16:01:59 | 1 |
| 2021-03-12 16:02:30 | 1 |
| 2021-03-12 16:03:00 | 1 |
| 2021-03-12 16:03:31 | 1 |
| 2021-03-12 16:04:02 | 1 |
| 2021-03-12 16:04:32 | 1 |
| 2021-03-12 16:05:03 | 1 |
| 2021-03-12 16:05:34 | 1 |
| 2021-03-12 16:06:05 | 1 |
| 2021-03-12 16:06:35 | 1 |
| 2021-03-12 16:07:06 | 1 |
| 2021-03-12 16:07:37 | 1 |
| 2021-03-12 16:08:07 | 1 |
| 2021-03-12 16:08:38 | 1 |
| 2021-03-12 16:09:09 | 1 |
| 2021-03-12 16:09:39 | 1 |
| 2021-03-12 16:10:10 | 1 |
| 2021-03-12 16:10:41 | 1 |
| 2021-03-12 16:11:11 | 1 |
| 2021-03-12 16:11:42 | 1 |
| 2021-03-12 16:12:13 | 1 |
| 2021-03-12 16:12:43 | 1 |
| 2021-03-12 16:13:14 | 1 |
| 2021-03-12 16:13:45 | 1 |
| 2021-03-12 16:14:16 | 1 |
| 2021-03-12 16:14:46 | 1 |
| 2021-03-12 16:15:17 | 1 |
| 2021-03-12 16:15:48 | 1 |
| 2021-03-12 16:16:18 | 1 |
| 2021-03-12 16:16:49 | 1 |
| 2021-03-12 16:17:20 | 1 |
| 2021-03-12 16:17:50 | 1 |
| 2021-03-12 16:18:21 | 1 |
| 2021-03-12 16:18:52 | 1 |
| 2021-03-12 16:19:22 | 1 |
| 2021-03-12 16:19:53 | 1 |
| 2021-03-12 16:20:24 | 1 |
| 2021-03-12 16:20:54 | 1 |
| 2021-03-12 16:21:25 | 1 |
| 2021-03-12 16:21:56 | 1 |
| 2021-03-12 16:22:27 | 1 |
| 2021-03-12 16:22:57 | 1 |
| 2021-03-12 16:23:28 | 1 |
| 2021-03-12 16:23:59 | 1 |
| 2021-03-12 16:24:29 | 1 |
| 2021-03-12 16:25:00 | 1 |
| 2021-03-12 16:25:31 | 1 |
| 2021-03-12 16:26:01 | 1 |
| 2021-03-12 16:26:32 | 1 |
| 2021-03-12 16:27:03 | 1 |
| 2021-03-12 16:27:33 | 1 |
| 2021-03-12 16:28:04 | 1 |
| 2021-03-12 16:28:35 | 1 |
| 2021-03-12 16:29:05 | 1 |
| 2021-03-12 16:29:36 | 1 |
| 2021-03-12 16:30:07 | 1 |
| 2021-03-12 16:30:38 | 1 |
| 2021-03-12 16:31:08 | 1 |
| 2021-03-12 16:31:39 | 1 |
| 2021-03-12 16:32:10 | 1 |
| 2021-03-12 16:32:40 | 1 |
| 2021-03-12 16:33:11 | 1 |
| 2021-03-12 16:33:42 | 1 |
| 2021-03-12 16:34:12 | 1 |
| 2021-03-12 16:34:43 | 1 |
| 2021-03-12 16:35:14 | 1 |
| 2021-03-12 16:35:44 | 1 |
| 2021-03-12 16:36:15 | 1 |
| 2021-03-12 16:36:46 | 1 |
| 2021-03-12 16:37:17 | 1 |
| 2021-03-12 16:37:47 | 1 |
| 2021-03-12 16:38:18 | 1 |
| 2021-03-12 16:38:49 | 1 |
| 2021-03-12 16:39:19 | 1 |
| 2021-03-12 16:39:50 | 1 |
| 2021-03-12 16:40:21 | 1 |
| 2021-03-12 16:40:51 | 1 |
| 2021-03-12 16:41:22 | 1 |
| 2021-03-12 16:41:53 | 1 |
| 2021-03-12 16:42:23 | 1 |
| 2021-03-12 16:42:54 | 1 |
| 2021-03-12 16:43:25 | 1 |
| 2021-03-12 16:43:55 | 1 |
| 2021-03-12 16:44:26 | 1 |
| 2021-03-12 16:44:57 | 1 |
| 2021-03-12 16:45:28 | 1 |
| 2021-03-12 16:45:58 | 1 |
| 2021-03-12 16:46:29 | 1 |
| 2021-03-12 16:47:00 | 1 |
| 2021-03-12 16:47:30 | 1 |
| 2021-03-12 16:48:01 | 1 |
| 2021-03-12 16:48:32 | 1 |
| 2021-03-12 16:49:02 | 1 |
| 2021-03-12 16:49:33 | 1 |
| 2021-03-12 16:50:04 | 1 |
| 2021-03-12 16:50:34 | 1 |
| 2021-03-12 16:51:05 | 1 |
| 2021-03-12 16:51:36 | 1 |
| 2021-03-12 16:52:06 | 1 |
| 2021-03-12 16:52:37 | 1 |
| 2021-03-12 16:53:08 | 1 |
| 2021-03-12 16:53:39 | 1 |
| 2021-03-12 16:54:09 | 1 |
| 2021-03-12 16:54:40 | 1 |
| 2021-03-12 16:55:11 | 1 |
| 2021-03-12 16:55:41 | 1 |
| 2021-03-12 16:56:12 | 1 |
| 2021-03-12 16:56:43 | 1 |
| 2021-03-12 16:57:13 | 1 |
| 2021-03-12 16:57:44 | 1 |
| 2021-03-12 16:58:15 | 1 |
| 2021-03-12 16:58:45 | 1 |
| 2021-03-12 16:59:16 | 1 |
| 2021-03-12 16:59:47 | 1 |
| 2021-03-12 17:00:18 | 1 |
| 2021-03-12 17:00:48 | 1 |
| 2021-03-12 17:01:19 | 1 |
| 2021-03-12 17:01:50 | 1 |
| 2021-03-12 17:02:20 | 1 |
| 2021-03-12 17:02:51 | 1 |
| 2021-03-12 17:03:22 | 1 |
| 2021-03-12 17:03:52 | 1 |
| 2021-03-12 17:04:23 | 1 |
| 2021-03-12 17:04:54 | 1 |
| 2021-03-12 17:05:24 | 1 |
| 2021-03-12 17:05:55 | 1 |
| 2021-03-12 17:06:26 | 1 |
| 2021-03-12 17:06:56 | 1 |
| 2021-03-12 17:07:27 | 1 |
| 2021-03-12 17:07:58 | 1 |
| 2021-03-12 17:08:29 | 1 |
| 2021-03-12 17:08:59 | 1 |
| 2021-03-12 17:09:30 | 1 |
| 2021-03-12 17:10:01 | 1 |
| 2021-03-12 17:10:31 | 1 |
| 2021-03-12 17:11:02 | 1 |
| 2021-03-12 17:11:33 | 1 |
| 2021-03-12 17:12:03 | 1 |
| 2021-03-12 17:12:34 | 1 |
| 2021-03-12 17:13:05 | 1 |
| 2021-03-12 17:13:35 | 1 |
| 2021-03-12 17:14:06 | 1 |
| 2021-03-12 17:14:37 | 1 |
| 2021-03-12 17:15:07 | 1 |
| 2021-03-12 17:15:38 | 1 |
| 2021-03-12 17:16:09 | 1 |
| 2021-03-12 17:16:39 | 1 |
| 2021-03-12 17:17:10 | 1 |
| 2021-03-12 17:17:41 | 1 |
| 2021-03-12 17:18:12 | 1 |
| 2021-03-12 17:18:42 | 1 |
| 2021-03-12 17:19:13 | 1 |
| 2021-03-12 17:19:44 | 1 |
| 2021-03-12 17:20:14 | 1 |
| 2021-03-12 17:20:45 | 1 |
| 2021-03-12 17:21:16 | 1 |
| 2021-03-12 17:21:46 | 1 |
| 2021-03-12 17:22:17 | 1 |
| 2021-03-12 17:22:48 | 1 |
| 2021-03-12 17:23:18 | 1 |
| 2021-03-12 17:23:49 | 1 |
| 2021-03-12 17:24:20 | 1 |
| 2021-03-12 17:24:50 | 1 |
| 2021-03-12 17:25:21 | 1 |
| 2021-03-12 17:25:52 | 1 |
| 2021-03-12 17:26:23 | 1 |
| 2021-03-12 17:26:53 | 1 |
| 2021-03-12 17:27:24 | 1 |
| 2021-03-12 17:27:55 | 1 |
| 2021-03-12 17:28:25 | 1 |
| 2021-03-12 17:28:56 | 1 |
| 2021-03-12 17:29:27 | 1 |
| 2021-03-12 17:29:57 | 1 |
| 2021-03-12 17:30:28 | 1 |
| 2021-03-12 17:30:59 | 1 |
| 2021-03-12 17:31:29 | 1 |
| 2021-03-12 17:32:00 | 1 |
| 2021-03-12 17:32:31 | 1 |
| 2021-03-12 17:33:01 | 1 |
| 2021-03-12 17:33:32 | 1 |
| 2021-03-12 17:34:03 | 1 |
| 2021-03-12 17:34:34 | 1 |
| 2021-03-12 17:35:04 | 1 |
| 2021-03-12 17:35:35 | 1 |
| 2021-03-12 17:36:06 | 1 |
| 2021-03-12 17:36:36 | 1 |
| 2021-03-12 17:37:07 | 1 |
| 2021-03-12 17:37:38 | 1 |
| 2021-03-12 17:38:08 | 1 |
| 2021-03-12 17:38:39 | 1 |
| 2021-03-12 17:39:10 | 1 |
| 2021-03-12 17:39:40 | 1 |
| 2021-03-12 17:40:11 | 1 |
| 2021-03-12 17:40:42 | 1 |
| 2021-03-12 17:41:12 | 1 |
| 2021-03-12 17:41:43 | 1 |
| 2021-03-12 17:42:14 | 1 |
| 2021-03-12 17:42:45 | 1 |
| 2021-03-12 17:43:15 | 1 |
| 2021-03-12 17:43:46 | 1 |
| 2021-03-12 17:44:17 | 1 |
| 2021-03-12 17:44:47 | 1 |
| 2021-03-12 17:45:18 | 1 |
| 2021-03-12 17:45:49 | 1 |
| 2021-03-12 17:46:19 | 1 |
| 2021-03-12 17:46:50 | 1 |
| 2021-03-12 17:47:21 | 1 |
| 2021-03-12 17:47:51 | 1 |
| 2021-03-12 17:48:22 | 1 |
| 2021-03-12 17:48:53 | 1 |
| 2021-03-12 17:49:23 | 1 |
| 2021-03-12 17:49:54 | 1 |
| 2021-03-12 17:50:25 | 1 |
| 2021-03-12 17:50:56 | 1 |
| 2021-03-12 17:51:26 | 1 |
| 2021-03-12 17:51:57 | 1 |
| 2021-03-12 17:52:28 | 1 |
| 2021-03-12 17:52:58 | 1 |
| 2021-03-12 17:53:29 | 1 |
| 2021-03-12 17:54:00 | 1 |
| 2021-03-12 17:54:30 | 1 |
| 2021-03-12 17:55:01 | 1 |
| 2021-03-12 17:55:32 | 1 |
| 2021-03-12 17:56:02 | 1 |
| 2021-03-12 17:56:33 | 1 |
| 2021-03-12 17:57:04 | 1 |
| 2021-03-12 17:57:35 | 1 |
| 2021-03-12 17:58:05 | 1 |
| 2021-03-12 17:58:36 | 1 |
| 2021-03-12 17:59:07 | 1 |
| 2021-03-12 17:59:37 | 1 |
| 2021-03-12 18:00:08 | 1 |
| 2021-03-12 18:00:39 | 1 |
| 2021-03-12 18:01:09 | 1 |
| 2021-03-12 18:01:40 | 1 |
| 2021-03-12 18:02:11 | 1 |
| 2021-03-12 18:02:41 | 1 |
| 2021-03-12 18:03:12 | 1 |
| 2021-03-12 18:03:43 | 1 |
| 2021-03-12 18:04:13 | 1 |
| 2021-03-12 18:04:44 | 1 |
| 2021-03-12 18:05:15 | 1 |
| 2021-03-12 18:05:46 | 1 |
| 2021-03-12 18:06:16 | 1 |
| 2021-03-12 18:06:47 | 1 |
| 2021-03-12 18:07:18 | 1 |
| 2021-03-12 18:07:48 | 1 |
| 2021-03-12 18:08:19 | 1 |
| 2021-03-12 18:08:50 | 1 |
| 2021-03-12 18:09:20 | 1 |
| 2021-03-12 18:09:51 | 1 |
| 2021-03-12 18:10:22 | 1 |
| 2021-03-12 18:10:52 | 1 |
| 2021-03-12 18:11:23 | 1 |
| 2021-03-12 18:11:54 | 1 |
| 2021-03-12 18:12:25 | 1 |
| 2021-03-12 18:12:55 | 1 |
| 2021-03-12 18:13:26 | 1 |
| 2021-03-12 18:13:57 | 1 |
| 2021-03-12 18:14:27 | 1 |
| 2021-03-12 18:14:58 | 1 |
| 2021-03-12 18:15:29 | 1 |
| 2021-03-12 18:15:59 | 1 |
| 2021-03-12 18:16:30 | 1 |
| 2021-03-12 18:17:01 | 1 |
| 2021-03-12 18:17:31 | 1 |
| 2021-03-12 18:18:02 | 1 |
| 2021-03-12 18:18:33 | 1 |
| 2021-03-12 18:19:03 | 1 |
| 2021-03-12 18:19:34 | 1 |
| 2021-03-12 18:20:05 | 1 |
| 2021-03-12 18:20:36 | 1 |
| 2021-03-12 18:21:06 | 1 |
| 2021-03-12 18:21:37 | 1 |
| 2021-03-12 18:22:08 | 1 |
| 2021-03-12 18:22:38 | 1 |
| 2021-03-12 18:23:09 | 1 |
| 2021-03-12 18:23:40 | 1 |
| 2021-03-12 18:24:10 | 1 |
| 2021-03-12 18:24:41 | 1 |
| 2021-03-12 18:25:12 | 1 |
| 2021-03-12 18:25:42 | 1 |
| 2021-03-12 18:26:13 | 1 |
| 2021-03-12 18:26:44 | 1 |
| 2021-03-12 18:27:14 | 1 |
| 2021-03-12 18:27:45 | 1 |
| 2021-03-12 18:28:16 | 1 |
| 2021-03-12 18:28:47 | 1 |
| 2021-03-12 18:29:17 | 1 |
| 2021-03-12 18:29:48 | 1 |
| 2021-03-12 18:30:19 | 1 |
| 2021-03-12 18:30:49 | 1 |
| 2021-03-12 18:31:20 | 1 |
| 2021-03-12 18:31:51 | 1 |
| 2021-03-12 18:32:21 | 1 |
| 2021-03-12 18:32:52 | 1 |
| 2021-03-12 18:33:23 | 1 |
| 2021-03-12 18:33:53 | 1 |
| 2021-03-12 18:34:24 | 1 |
| 2021-03-12 18:34:55 | 1 |
| 2021-03-12 18:35:25 | 1 |
| 2021-03-12 18:35:56 | 1 |
| 2021-03-12 18:36:27 | 1 |
| 2021-03-12 18:36:58 | 1 |
| 2021-03-12 18:37:28 | 1 |
| 2021-03-12 18:37:59 | 1 |
| 2021-03-12 18:38:30 | 1 |
| 2021-03-12 18:39:00 | 1 |
| 2021-03-12 18:39:31 | 1 |
| 2021-03-12 18:40:02 | 1 |
| 2021-03-12 18:40:32 | 1 |
| 2021-03-12 18:41:03 | 1 |
| 2021-03-12 18:41:34 | 1 |
| 2021-03-12 18:42:04 | 1 |
| 2021-03-12 18:42:35 | 1 |
| 2021-03-12 18:43:06 | 1 |
| 2021-03-12 18:43:36 | 1 |
| 2021-03-12 18:44:07 | 1 |
| 2021-03-12 18:44:38 | 1 |
| 2021-03-12 18:45:09 | 1 |
| 2021-03-12 18:45:39 | 1 |
| 2021-03-12 18:46:10 | 1 |
| 2021-03-12 18:46:41 | 1 |
| 2021-03-12 18:47:11 | 1 |
| 2021-03-12 18:47:42 | 1 |
| 2021-03-12 18:48:13 | 1 |
| 2021-03-12 18:48:43 | 1 |
| 2021-03-12 18:49:14 | 1 |
| 2021-03-12 18:49:45 | 1 |
| 2021-03-12 18:50:15 | 1 |
| 2021-03-12 18:50:46 | 1 |
| 2021-03-12 18:51:17 | 1 |
| 2021-03-12 18:51:48 | 1 |
| 2021-03-12 18:52:18 | 1 |
| 2021-03-12 18:52:49 | 1 |
| 2021-03-12 18:53:20 | 1 |
| 2021-03-12 18:53:50 | 1 |
| 2021-03-12 18:54:21 | 1 |
| 2021-03-12 18:54:52 | 1 |
| 2021-03-12 18:55:22 | 1 |
| 2021-03-12 18:55:53 | 1 |
| 2021-03-12 18:56:24 | 1 |
| 2021-03-12 18:56:54 | 1 |
| 2021-03-12 18:57:25 | 1 |
| 2021-03-12 18:57:56 | 1 |
| 2021-03-12 18:58:26 | 1 |
| 2021-03-12 18:58:57 | 1 |
| 2021-03-12 18:59:28 | 1 |
| 2021-03-12 18:59:59 | 1 |
| 2021-03-12 19:00:29 | 1 |
| 2021-03-12 19:01:00 | 1 |
| 2021-03-12 19:01:31 | 1 |
| 2021-03-12 19:02:01 | 1 |
| 2021-03-12 19:02:32 | 1 |
| 2021-03-12 19:03:03 | 1 |
| 2021-03-12 19:03:33 | 1 |
| 2021-03-12 19:04:04 | 1 |
| 2021-03-12 19:04:35 | 1 |
| 2021-03-12 19:05:05 | 1 |
| 2021-03-12 19:05:36 | 1 |
| 2021-03-12 19:06:07 | 1 |
| 2021-03-12 19:06:37 | 1 |
| 2021-03-12 19:07:08 | 1 |
| 2021-03-12 19:07:39 | 1 |
| 2021-03-12 19:08:10 | 1 |
| 2021-03-12 19:08:40 | 1 |
| 2021-03-12 19:09:11 | 1 |
| 2021-03-12 19:09:42 | 1 |
| 2021-03-12 19:10:12 | 1 |
| 2021-03-12 19:10:43 | 1 |
| 2021-03-12 19:11:14 | 1 |
| 2021-03-12 19:11:44 | 1 |
| 2021-03-12 19:12:15 | 1 |
| 2021-03-12 19:12:46 | 1 |
| 2021-03-12 19:13:16 | 1 |
| 2021-03-12 19:13:47 | 1 |
| 2021-03-12 19:14:18 | 1 |
| 2021-03-12 19:14:48 | 1 |
| 2021-03-12 19:15:19 | 1 |
| 2021-03-12 19:15:50 | 1 |
| 2021-03-12 19:16:21 | 1 |
| 2021-03-12 19:16:51 | 1 |
| 2021-03-12 19:17:22 | 1 |
| 2021-03-12 19:17:53 | 1 |
| 2021-03-12 19:18:23 | 1 |
| 2021-03-12 19:18:54 | 1 |
| 2021-03-12 19:19:25 | 1 |
| 2021-03-12 19:19:55 | 1 |
| 2021-03-12 19:20:26 | 1 |
| 2021-03-12 19:20:57 | 1 |
| 2021-03-12 19:21:27 | 1 |
| 2021-03-12 19:21:58 | 1 |
| 2021-03-12 19:22:29 | 1 |
| 2021-03-12 19:22:59 | 1 |
| 2021-03-12 19:23:30 | 1 |
| 2021-03-12 19:24:01 | 1 |
| 2021-03-12 19:24:32 | 1 |
| 2021-03-12 19:25:02 | 1 |
| 2021-03-12 19:25:33 | 1 |
| 2021-03-12 19:26:04 | 1 |
| 2021-03-12 19:26:34 | 1 |
| 2021-03-12 19:27:05 | 1 |
| 2021-03-12 19:27:36 | 1 |
| 2021-03-12 19:28:06 | 1 |
| 2021-03-12 19:28:37 | 1 |
| 2021-03-12 19:29:08 | 1 |
| 2021-03-12 19:29:38 | 1 |
| 2021-03-12 19:30:09 | 1 |
| 2021-03-12 19:30:40 | 1 |
| 2021-03-12 19:31:10 | 1 |
| 2021-03-12 19:31:41 | 1 |
| 2021-03-12 19:32:12 | 1 |
| 2021-03-12 19:32:42 | 1 |
| 2021-03-12 19:33:13 | 1 |
| 2021-03-12 19:33:44 | 1 |
| 2021-03-12 19:34:15 | 1 |
| 2021-03-12 19:34:45 | 1 |
| 2021-03-12 19:35:16 | 1 |
| 2021-03-12 19:35:47 | 1 |
| 2021-03-12 19:36:17 | 1 |
| 2021-03-12 19:36:48 | 1 |
| 2021-03-12 19:37:19 | 1 |
| 2021-03-12 19:37:49 | 1 |
| 2021-03-12 19:38:20 | 1 |
| 2021-03-12 19:38:51 | 1 |
| 2021-03-12 19:39:21 | 1 |
| 2021-03-12 19:39:52 | 1 |
| 2021-03-12 19:40:23 | 1 |
| 2021-03-12 19:40:54 | 1 |
| 2021-03-12 19:41:24 | 1 |
| 2021-03-12 19:41:55 | 1 |
| 2021-03-12 19:42:26 | 1 |
| 2021-03-12 19:42:56 | 1 |
| 2021-03-12 19:43:27 | 1 |
| 2021-03-12 19:43:58 | 1 |
| 2021-03-12 19:44:28 | 1 |
| 2021-03-12 19:44:59 | 1 |
| 2021-03-12 19:45:30 | 1 |
| 2021-03-12 19:46:00 | 1 |
| 2021-03-12 19:46:31 | 1 |
| 2021-03-12 19:47:02 | 1 |
| 2021-03-12 19:47:32 | 1 |
| 2021-03-12 19:48:03 | 1 |
| 2021-03-12 19:48:34 | 1 |
| 2021-03-12 19:49:05 | 1 |
| 2021-03-12 19:49:35 | 1 |
| 2021-03-12 19:50:06 | 1 |
| 2021-03-12 19:50:37 | 1 |
| 2021-03-12 19:51:07 | 1 |
| 2021-03-12 19:51:38 | 1 |
| 2021-03-12 19:52:09 | 1 |
| 2021-03-12 19:52:39 | 1 |
| 2021-03-12 19:53:10 | 1 |
| 2021-03-12 19:53:41 | 1 |
| 2021-03-12 19:54:11 | 1 |
| 2021-03-12 19:54:42 | 1 |
| 2021-03-12 19:55:13 | 1 |
| 2021-03-12 19:55:43 | 1 |
| 2021-03-12 19:56:14 | 1 |
| 2021-03-12 19:56:45 | 1 |
| 2021-03-12 19:57:16 | 1 |
| 2021-03-12 19:57:46 | 1 |
| 2021-03-12 19:58:17 | 1 |
| 2021-03-12 19:58:48 | 1 |
| 2021-03-12 19:59:18 | 1 |
| 2021-03-12 19:59:49 | 1 |
| 2021-03-12 20:00:20 | 1 |
| 2021-03-12 20:00:50 | 1 |
| 2021-03-12 20:01:21 | 1 |
| 2021-03-12 20:01:52 | 1 |
| 2021-03-12 20:02:22 | 1 |
| 2021-03-12 20:02:53 | 1 |
| 2021-03-12 20:03:24 | 1 |
| 2021-03-12 20:03:54 | 1 |
| 2021-03-12 20:04:25 | 1 |
| 2021-03-12 20:04:56 | 1 |
| 2021-03-12 20:05:27 | 1 |
| 2021-03-12 20:05:57 | 1 |
| 2021-03-12 20:06:28 | 1 |
| 2021-03-12 20:06:59 | 1 |
| 2021-03-12 20:07:29 | 1 |
| 2021-03-12 20:08:00 | 1 |
| 2021-03-12 20:08:31 | 1 |
| 2021-03-12 20:09:01 | 1 |
| 2021-03-12 20:09:32 | 1 |
| 2021-03-12 20:10:03 | 1 |
| 2021-03-12 20:10:33 | 1 |
| 2021-03-12 20:11:04 | 1 |
| 2021-03-12 20:11:35 | 1 |
| 2021-03-12 20:12:05 | 1 |
| 2021-03-12 20:12:36 | 1 |
| 2021-03-12 20:13:07 | 1 |
| 2021-03-12 20:13:38 | 1 |
| 2021-03-12 20:14:08 | 1 |
| 2021-03-12 20:14:39 | 1 |
| 2021-03-12 20:15:10 | 1 |
| 2021-03-12 20:15:40 | 1 |
| 2021-03-12 20:16:11 | 1 |
| 2021-03-12 20:16:42 | 1 |
| 2021-03-12 20:17:12 | 1 |
| 2021-03-12 20:17:43 | 1 |
| 2021-03-12 20:18:14 | 1 |
| 2021-03-12 20:18:44 | 1 |
| 2021-03-12 20:19:15 | 1 |
| 2021-03-12 20:19:46 | 1 |
| 2021-03-12 20:20:16 | 1 |
| 2021-03-12 20:20:47 | 1 |
| 2021-03-12 20:21:18 | 1 |
| 2021-03-12 20:21:48 | 1 |
| 2021-03-12 20:22:19 | 1 |
| 2021-03-12 20:22:50 | 1 |
| 2021-03-12 20:23:21 | 1 |
| 2021-03-12 20:23:51 | 1 |
| 2021-03-12 20:24:22 | 1 |
| 2021-03-12 20:24:53 | 1 |
| 2021-03-12 20:25:23 | 1 |
| 2021-03-12 20:25:54 | 1 |
| 2021-03-12 20:26:25 | 1 |
| 2021-03-12 20:26:55 | 1 |
| 2021-03-12 20:27:26 | 1 |
| 2021-03-12 20:27:57 | 1 |
| 2021-03-12 20:28:27 | 1 |
| 2021-03-12 20:28:58 | 1 |
| 2021-03-12 20:29:29 | 1 |
| 2021-03-12 20:29:59 | 1 |
| 2021-03-12 20:30:30 | 1 |
| 2021-03-12 20:31:01 | 1 |
| 2021-03-12 20:31:32 | 1 |
| 2021-03-12 20:32:02 | 1 |
| 2021-03-12 20:32:33 | 1 |
| 2021-03-12 20:33:04 | 1 |
| 2021-03-12 20:33:34 | 1 |
| 2021-03-12 20:34:05 | 1 |
| 2021-03-12 20:34:36 | 1 |
| 2021-03-12 20:35:06 | 1 |
| 2021-03-12 20:35:37 | 1 |
| 2021-03-12 20:36:08 | 1 |
| 2021-03-12 20:36:38 | 1 |
| 2021-03-12 20:37:09 | 1 |
| 2021-03-12 20:37:40 | 1 |
| 2021-03-12 20:38:10 | 1 |
| 2021-03-12 20:38:41 | 1 |
| 2021-03-12 20:39:12 | 1 |
| 2021-03-12 20:39:42 | 1 |
| 2021-03-12 20:40:13 | 1 |
| 2021-03-12 20:40:44 | 1 |
| 2021-03-12 20:41:15 | 1 |
| 2021-03-12 20:41:45 | 1 |
| 2021-03-12 20:42:16 | 1 |
| 2021-03-12 20:42:47 | 1 |
| 2021-03-12 20:43:17 | 1 |
| 2021-03-12 20:43:48 | 1 |
| 2021-03-12 20:44:19 | 1 |
| 2021-03-12 20:44:49 | 1 |
| 2021-03-12 20:45:20 | 1 |
| 2021-03-12 20:45:51 | 1 |
| 2021-03-12 20:46:21 | 1 |
| 2021-03-12 20:46:52 | 1 |
| 2021-03-12 20:47:23 | 1 |
| 2021-03-12 20:47:54 | 1 |
| 2021-03-12 20:48:24 | 1 |
| 2021-03-12 20:48:55 | 1 |
| 2021-03-12 20:49:26 | 1 |
| 2021-03-12 20:49:56 | 1 |
| 2021-03-12 20:50:27 | 1 |
| 2021-03-12 20:50:58 | 1 |
| 2021-03-12 20:51:28 | 1 |
| 2021-03-12 20:51:59 | 1 |
| 2021-03-12 20:52:30 | 1 |
| 2021-03-12 20:53:00 | 1 |
| 2021-03-12 20:53:31 | 1 |
| 2021-03-12 20:54:02 | 1 |
| 2021-03-12 20:54:32 | 1 |
| 2021-03-12 20:55:03 | 1 |
| 2021-03-12 20:55:34 | 1 |
| 2021-03-12 20:56:05 | 1 |
| 2021-03-12 20:56:35 | 1 |
| 2021-03-12 20:57:06 | 1 |
| 2021-03-12 20:57:37 | 1 |
| 2021-03-12 20:58:07 | 1 |
| 2021-03-12 20:58:38 | 1 |
| 2021-03-12 20:59:09 | 1 |
| 2021-03-12 20:59:39 | 1 |
| 2021-03-12 21:00:10 | 1 |
| 2021-03-12 21:00:41 | 1 |
| 2021-03-12 21:01:11 | 1 |
| 2021-03-12 21:01:42 | 1 |
| 2021-03-12 21:02:13 | 1 |
| 2021-03-12 21:02:43 | 1 |
| 2021-03-12 21:03:14 | 1 |
| 2021-03-12 21:03:45 | 1 |
| 2021-03-12 21:04:16 | 1 |
| 2021-03-12 21:04:46 | 1 |
| 2021-03-12 21:05:17 | 1 |
| 2021-03-12 21:05:48 | 1 |
| 2021-03-12 21:06:18 | 1 |
| 2021-03-12 21:06:49 | 1 |
| 2021-03-12 21:07:20 | 1 |
| 2021-03-12 21:07:50 | 1 |
| 2021-03-12 21:08:21 | 1 |
| 2021-03-12 21:08:52 | 1 |
| 2021-03-12 21:09:22 | 1 |
| 2021-03-12 21:09:53 | 1 |
| 2021-03-12 21:10:24 | 1 |
| 2021-03-12 21:10:54 | 1 |
| 2021-03-12 21:11:25 | 1 |
| 2021-03-12 21:11:56 | 1 |
| 2021-03-12 21:12:27 | 1 |
| 2021-03-12 21:12:57 | 1 |
| 2021-03-12 21:13:28 | 1 |
| 2021-03-12 21:13:59 | 1 |
| 2021-03-12 21:14:29 | 1 |
| 2021-03-12 21:15:00 | 1 |
| 2021-03-12 21:15:31 | 1 |
| 2021-03-12 21:16:01 | 1 |
| 2021-03-12 21:16:32 | 1 |
| 2021-03-12 21:17:03 | 1 |
| 2021-03-12 21:17:33 | 1 |
| 2021-03-12 21:18:04 | 1 |
| 2021-03-12 21:18:35 | 1 |
| 2021-03-12 21:19:06 | 1 |
| 2021-03-12 21:19:36 | 1 |
| 2021-03-12 21:20:07 | 1 |
| 2021-03-12 21:20:38 | 1 |
| 2021-03-12 21:21:08 | 1 |
| 2021-03-12 21:21:39 | 1 |
| 2021-03-12 21:22:10 | 1 |
| 2021-03-12 21:22:40 | 1 |
| 2021-03-12 21:23:11 | 1 |
| 2021-03-12 21:23:42 | 1 |
| 2021-03-12 21:24:12 | 1 |
| 2021-03-12 21:24:43 | 1 |
| 2021-03-12 21:25:14 | 1 |
| 2021-03-12 21:25:45 | 1 |
| 2021-03-12 21:26:15 | 1 |
| 2021-03-12 21:26:46 | 1 |
| 2021-03-12 21:27:17 | 1 |
| 2021-03-12 21:27:47 | 1 |
| 2021-03-12 21:28:18 | 1 |
| 2021-03-12 21:28:49 | 1 |
| 2021-03-12 21:29:19 | 1 |
| 2021-03-12 21:29:50 | 1 |
| 2021-03-12 21:30:21 | 1 |
| 2021-03-12 21:30:51 | 1 |
| 2021-03-12 21:31:22 | 1 |
| 2021-03-12 21:31:53 | 1 |
| 2021-03-12 21:32:24 | 1 |
| 2021-03-12 21:32:54 | 1 |
| 2021-03-12 21:33:25 | 1 |
| 2021-03-12 21:33:56 | 1 |
| 2021-03-12 21:34:26 | 1 |
| 2021-03-12 21:34:57 | 1 |
| 2021-03-12 21:35:28 | 1 |
| 2021-03-12 21:35:58 | 1 |
| 2021-03-12 21:36:29 | 1 |
| 2021-03-12 21:37:00 | 1 |
| 2021-03-12 21:37:30 | 1 |
| 2021-03-12 21:38:01 | 1 |
| 2021-03-12 21:38:32 | 1 |
| 2021-03-12 21:39:03 | 1 |
| 2021-03-12 21:39:33 | 1 |
| 2021-03-12 21:40:04 | 1 |
| 2021-03-12 21:40:35 | 1 |
| 2021-03-12 21:41:05 | 1 |
| 2021-03-12 21:41:36 | 1 |
| 2021-03-12 21:42:07 | 1 |
| 2021-03-12 21:42:37 | 1 |
| 2021-03-12 21:43:08 | 1 |
| 2021-03-12 21:43:39 | 1 |
| 2021-03-12 21:44:09 | 1 |
| 2021-03-12 21:44:40 | 1 |
| 2021-03-12 21:45:11 | 1 |
| 2021-03-12 21:45:42 | 1 |
| 2021-03-12 21:46:12 | 1 |
| 2021-03-12 21:46:43 | 1 |
| 2021-03-12 21:47:14 | 1 |
| 2021-03-12 21:47:44 | 1 |
| 2021-03-12 21:48:15 | 1 |
| 2021-03-12 21:48:46 | 1 |
| 2021-03-12 21:49:16 | 1 |
| 2021-03-12 21:49:47 | 1 |
| 2021-03-12 21:50:18 | 1 |
| 2021-03-12 21:50:48 | 1 |
| 2021-03-12 21:51:19 | 1 |
| 2021-03-12 21:51:50 | 1 |
| 2021-03-12 21:52:21 | 1 |
| 2021-03-12 21:52:51 | 1 |
| 2021-03-12 21:53:22 | 1 |
| 2021-03-12 21:53:53 | 1 |
| 2021-03-12 21:54:23 | 1 |
| 2021-03-12 21:54:54 | 1 |
| 2021-03-12 21:55:25 | 1 |
| 2021-03-12 21:55:55 | 1 |
| 2021-03-12 21:56:26 | 1 |
| 2021-03-12 21:56:57 | 1 |
| 2021-03-12 21:57:27 | 1 |
| 2021-03-12 21:57:58 | 1 |
| 2021-03-12 21:58:29 | 1 |
| 2021-03-12 21:59:00 | 1 |
| 2021-03-12 21:59:30 | 1 |
| 2021-03-12 22:00:01 | 1 |
| 2021-03-12 22:00:32 | 1 |
| 2021-03-12 22:01:02 | 1 |
| 2021-03-12 22:01:33 | 1 |
| 2021-03-12 22:02:04 | 1 |
| 2021-03-12 22:02:34 | 1 |
| 2021-03-12 22:03:05 | 1 |
| 2021-03-12 22:03:36 | 1 |
| 2021-03-12 22:04:06 | 1 |
| 2021-03-12 22:04:37 | 1 |
| 2021-03-12 22:05:08 | 1 |
| 2021-03-12 22:05:39 | 1 |
| 2021-03-12 22:06:09 | 1 |
| 2021-03-12 22:06:40 | 1 |
| 2021-03-12 22:07:11 | 1 |
| 2021-03-12 22:07:41 | 1 |
| 2021-03-12 22:08:12 | 1 |
| 2021-03-12 22:08:43 | 1 |
| 2021-03-12 22:09:13 | 1 |
| 2021-03-12 22:09:44 | 1 |
| 2021-03-12 22:10:15 | 1 |
| 2021-03-12 22:10:45 | 1 |
| 2021-03-12 22:11:16 | 1 |
| 2021-03-12 22:11:47 | 1 |
| 2021-03-12 22:12:17 | 1 |
| 2021-03-12 22:12:48 | 1 |
| 2021-03-12 22:13:19 | 1 |
| 2021-03-12 22:13:50 | 1 |
| 2021-03-12 22:14:20 | 1 |
| 2021-03-12 22:14:51 | 1 |
| 2021-03-12 22:15:22 | 1 |
| 2021-03-12 22:15:52 | 1 |
| 2021-03-12 22:16:23 | 1 |
| 2021-03-12 22:16:54 | 1 |
| 2021-03-12 22:17:24 | 1 |
| 2021-03-12 22:17:55 | 1 |
| 2021-03-12 22:18:26 | 1 |
| 2021-03-12 22:18:56 | 1 |
| 2021-03-12 22:19:27 | 1 |
| 2021-03-12 22:19:58 | 1 |
| 2021-03-12 22:20:29 | 1 |
| 2021-03-12 22:20:59 | 1 |
| 2021-03-12 22:21:30 | 1 |
| 2021-03-12 22:22:01 | 1 |
| 2021-03-12 22:22:31 | 1 |
| 2021-03-12 22:23:02 | 1 |
| 2021-03-12 22:23:33 | 1 |
| 2021-03-12 22:24:03 | 1 |
| 2021-03-12 22:24:34 | 1 |
| 2021-03-12 22:25:05 | 1 |
| 2021-03-12 22:25:35 | 1 |
| 2021-03-12 22:26:06 | 1 |
| 2021-03-12 22:26:37 | 1 |
| 2021-03-12 22:27:08 | 1 |
| 2021-03-12 22:27:38 | 1 |
| 2021-03-12 22:28:09 | 1 |
| 2021-03-12 22:28:40 | 1 |
| 2021-03-12 22:29:10 | 1 |
| 2021-03-12 22:29:41 | 1 |
| 2021-03-12 22:30:12 | 1 |
| 2021-03-12 22:30:42 | 1 |
| 2021-03-12 22:31:13 | 1 |
| 2021-03-12 22:31:44 | 1 |
| 2021-03-12 22:32:14 | 1 |
| 2021-03-12 22:32:45 | 1 |
| 2021-03-12 22:33:16 | 1 |
| 2021-03-12 22:33:47 | 1 |
| 2021-03-12 22:34:17 | 1 |
| 2021-03-12 22:34:48 | 1 |
| 2021-03-12 22:35:19 | 1 |
| 2021-03-12 22:35:49 | 1 |
| 2021-03-12 22:36:20 | 1 |
| 2021-03-12 22:36:51 | 1 |
| 2021-03-12 22:37:21 | 1 |
| 2021-03-12 22:37:52 | 1 |
| 2021-03-12 22:38:23 | 1 |
| 2021-03-12 22:38:53 | 1 |
| 2021-03-12 22:39:24 | 1 |
| 2021-03-12 22:39:55 | 1 |
| 2021-03-12 22:40:25 | 1 |
| 2021-03-12 22:40:56 | 1 |
| 2021-03-12 22:41:27 | 1 |
| 2021-03-12 22:41:58 | 1 |
| 2021-03-12 22:42:28 | 1 |
| 2021-03-12 22:42:59 | 1 |
| 2021-03-12 22:43:30 | 1 |
| 2021-03-12 22:44:00 | 1 |
| 2021-03-12 22:44:31 | 1 |
| 2021-03-12 22:45:02 | 1 |
| 2021-03-12 22:45:32 | 1 |
| 2021-03-12 22:46:03 | 1 |
| 2021-03-12 22:46:34 | 1 |
| 2021-03-12 22:47:04 | 1 |
| 2021-03-12 22:47:35 | 1 |
| 2021-03-12 22:48:06 | 1 |
| 2021-03-12 22:48:37 | 1 |
| 2021-03-12 22:49:07 | 1 |
| 2021-03-12 22:49:38 | 1 |
| 2021-03-12 22:50:09 | 1 |
| 2021-03-12 22:50:39 | 1 |
| 2021-03-12 22:51:10 | 1 |
| 2021-03-12 22:51:41 | 1 |
| 2021-03-12 22:52:11 | 1 |
| 2021-03-12 22:52:42 | 1 |
| 2021-03-12 22:53:13 | 1 |
| 2021-03-12 22:53:43 | 1 |
| 2021-03-12 22:54:14 | 1 |
| 2021-03-12 22:54:45 | 1 |
| 2021-03-12 22:55:16 | 1 |
| 2021-03-12 22:55:46 | 1 |
| 2021-03-12 22:56:17 | 1 |
| 2021-03-12 22:56:48 | 1 |
| 2021-03-12 22:57:18 | 1 |
| 2021-03-12 22:57:49 | 1 |
| 2021-03-12 22:58:20 | 1 |
| 2021-03-12 22:58:50 | 1 |
| 2021-03-12 22:59:21 | 1 |
| 2021-03-12 22:59:52 | 1 |
| 2021-03-12 23:00:22 | 1 |
| 2021-03-12 23:00:53 | 1 |
| 2021-03-12 23:01:24 | 1 |
| 2021-03-12 23:01:54 | 1 |
| 2021-03-12 23:02:25 | 1 |
| 2021-03-12 23:02:56 | 1 |
| 2021-03-12 23:03:27 | 1 |
| 2021-03-12 23:03:57 | 1 |
| 2021-03-12 23:04:28 | 1 |
| 2021-03-12 23:04:59 | 1 |
| 2021-03-12 23:05:29 | 1 |
| 2021-03-12 23:06:00 | 1 |
| 2021-03-12 23:06:31 | 1 |
| 2021-03-12 23:07:01 | 1 |
| 2021-03-12 23:07:32 | 1 |
| 2021-03-12 23:08:03 | 1 |
| 2021-03-12 23:08:33 | 1 |
| 2021-03-12 23:09:04 | 1 |
| 2021-03-12 23:09:35 | 1 |
| 2021-03-12 23:10:06 | 1 |
| 2021-03-12 23:10:36 | 1 |
| 2021-03-12 23:11:07 | 1 |
| 2021-03-12 23:11:38 | 1 |
| 2021-03-12 23:12:08 | 1 |
| 2021-03-12 23:12:39 | 1 |
| 2021-03-12 23:13:10 | 1 |
| 2021-03-12 23:13:40 | 1 |
| 2021-03-12 23:14:11 | 1 |
| 2021-03-12 23:14:42 | 1 |
| 2021-03-12 23:15:12 | 1 |
| 2021-03-12 23:15:43 | 1 |
| 2021-03-12 23:16:14 | 1 |
| 2021-03-12 23:16:45 | 1 |
| 2021-03-12 23:17:15 | 1 |
| 2021-03-12 23:17:46 | 1 |
| 2021-03-12 23:18:17 | 1 |
| 2021-03-12 23:18:47 | 1 |
| 2021-03-12 23:19:18 | 1 |
| 2021-03-12 23:19:49 | 1 |
| 2021-03-12 23:20:19 | 1 |
| 2021-03-12 23:20:50 | 1 |
| 2021-03-12 23:21:21 | 1 |
| 2021-03-12 23:21:51 | 1 |
| 2021-03-12 23:22:22 | 1 |
| 2021-03-12 23:22:53 | 1 |
| 2021-03-12 23:23:24 | 1 |
| 2021-03-12 23:23:54 | 1 |
| 2021-03-12 23:24:25 | 1 |
| 2021-03-12 23:24:56 | 1 |
| 2021-03-12 23:25:26 | 1 |
| 2021-03-12 23:25:57 | 1 |
| 2021-03-12 23:26:28 | 1 |
| 2021-03-12 23:26:58 | 1 |
| 2021-03-12 23:27:29 | 1 |
| 2021-03-12 23:28:00 | 1 |
| 2021-03-12 23:28:30 | 1 |
| 2021-03-12 23:29:01 | 1 |
| 2021-03-12 23:29:32 | 1 |
| 2021-03-12 23:30:03 | 1 |
| 2021-03-12 23:30:33 | 1 |
| 2021-03-12 23:31:04 | 1 |
| 2021-03-12 23:31:35 | 1 |
| 2021-03-12 23:32:05 | 1 |
| 2021-03-12 23:32:36 | 1 |
| 2021-03-12 23:33:07 | 1 |
| 2021-03-12 23:33:37 | 1 |
| 2021-03-12 23:34:08 | 1 |
| 2021-03-12 23:34:39 | 1 |
| 2021-03-12 23:35:09 | 1 |
| 2021-03-12 23:35:40 | 1 |
| 2021-03-12 23:36:11 | 1 |
| 2021-03-12 23:36:42 | 1 |
| 2021-03-12 23:37:12 | 1 |
| 2021-03-12 23:37:43 | 1 |
| 2021-03-12 23:38:14 | 1 |
| 2021-03-12 23:38:44 | 1 |
| 2021-03-12 23:39:15 | 1 |
| 2021-03-12 23:39:46 | 1 |
| 2021-03-12 23:40:16 | 1 |
| 2021-03-12 23:40:47 | 1 |
| 2021-03-12 23:41:18 | 1 |
| 2021-03-12 23:41:48 | 1 |
| 2021-03-12 23:42:19 | 1 |
| 2021-03-12 23:42:50 | 1 |
| 2021-03-12 23:43:20 | 1 |
| 2021-03-12 23:43:51 | 1 |
| 2021-03-12 23:44:22 | 1 |
| 2021-03-12 23:44:53 | 1 |
| 2021-03-12 23:45:23 | 1 |
| 2021-03-12 23:45:54 | 1 |
| 2021-03-12 23:46:25 | 1 |
| 2021-03-12 23:46:55 | 1 |
| 2021-03-12 23:47:26 | 1 |
| 2021-03-12 23:47:57 | 1 |
| 2021-03-12 23:48:27 | 1 |
| 2021-03-12 23:48:58 | 1 |
| 2021-03-12 23:49:29 | 1 |
| 2021-03-12 23:49:59 | 1 |
| 2021-03-12 23:50:30 | 1 |
| 2021-03-12 23:51:01 | 1 |
| 2021-03-12 23:51:32 | 1 |
| 2021-03-12 23:52:02 | 1 |
| 2021-03-12 23:52:33 | 1 |
| 2021-03-12 23:53:04 | 1 |
| 2021-03-12 23:53:34 | 1 |
| 2021-03-12 23:54:05 | 1 |
| 2021-03-12 23:54:36 | 1 |
| 2021-03-12 23:55:06 | 1 |
| 2021-03-12 23:55:37 | 1 |
| 2021-03-12 23:56:08 | 1 |
| 2021-03-12 23:56:38 | 1 |
| 2021-03-12 23:57:09 | 1 |
| 2021-03-12 23:57:40 | 1 |
| 2021-03-12 23:58:11 | 1 |
| 2021-03-12 23:58:41 | 1 |
| 2021-03-12 23:59:12 | 1 |
| 2021-03-12 23:59:43 | 1 |
| 2021-03-13 00:00:13 | 1 |
| 2021-03-13 00:00:44 | 1 |
| 2021-03-13 00:01:15 | 1 |
| 2021-03-13 00:01:45 | 1 |
| 2021-03-13 00:02:16 | 1 |
| 2021-03-13 00:02:47 | 1 |
| 2021-03-13 00:03:17 | 1 |
| 2021-03-13 00:03:48 | 1 |
| 2021-03-13 00:04:19 | 1 |
| 2021-03-13 00:04:50 | 1 |
| 2021-03-13 00:05:20 | 1 |
| 2021-03-13 00:05:51 | 1 |
| 2021-03-13 00:06:22 | 1 |
| 2021-03-13 00:06:52 | 1 |
| 2021-03-13 00:07:23 | 1 |
| 2021-03-13 00:07:54 | 1 |
| 2021-03-13 00:08:24 | 1 |
| 2021-03-13 00:08:55 | 1 |
| 2021-03-13 00:09:26 | 1 |
| 2021-03-13 00:09:56 | 1 |
| 2021-03-13 00:10:27 | 1 |
| 2021-03-13 00:10:58 | 1 |
| 2021-03-13 00:11:29 | 1 |
| 2021-03-13 00:11:59 | 1 |
| 2021-03-13 00:12:30 | 1 |
| 2021-03-13 00:13:01 | 1 |
| 2021-03-13 00:13:31 | 1 |
| 2021-03-13 00:14:02 | 1 |
| 2021-03-13 00:14:33 | 1 |
| 2021-03-13 00:15:03 | 1 |
| 2021-03-13 00:15:34 | 1 |
| 2021-03-13 00:16:05 | 1 |
| 2021-03-13 00:16:35 | 1 |
| 2021-03-13 00:17:06 | 1 |
| 2021-03-13 00:17:37 | 1 |
| 2021-03-13 00:18:08 | 1 |
| 2021-03-13 00:18:38 | 1 |
| 2021-03-13 00:19:09 | 1 |
| 2021-03-13 00:19:40 | 1 |
| 2021-03-13 00:20:10 | 1 |
| 2021-03-13 00:20:41 | 1 |
| 2021-03-13 00:21:12 | 1 |
| 2021-03-13 00:21:42 | 1 |
| 2021-03-13 00:22:13 | 1 |
| 2021-03-13 00:22:44 | 1 |
| 2021-03-13 00:23:14 | 1 |
| 2021-03-13 00:23:45 | 1 |
| 2021-03-13 00:24:16 | 1 |
| 2021-03-13 00:24:47 | 1 |
| 2021-03-13 00:25:17 | 1 |
| 2021-03-13 00:25:48 | 1 |
| 2021-03-13 00:26:19 | 1 |
| 2021-03-13 00:26:49 | 1 |
| 2021-03-13 00:27:20 | 1 |
| 2021-03-13 00:27:51 | 1 |
| 2021-03-13 00:28:21 | 1 |
| 2021-03-13 00:28:52 | 1 |
| 2021-03-13 00:29:23 | 1 |
| 2021-03-13 00:29:53 | 1 |
| 2021-03-13 00:30:24 | 1 |
| 2021-03-13 00:30:55 | 1 |
| 2021-03-13 00:31:26 | 1 |
| 2021-03-13 00:31:56 | 1 |
| 2021-03-13 00:32:27 | 1 |
| 2021-03-13 00:32:58 | 1 |
| 2021-03-13 00:33:28 | 1 |
| 2021-03-13 00:33:59 | 1 |
| 2021-03-13 00:34:30 | 1 |
| 2021-03-13 00:35:00 | 1 |
| 2021-03-13 00:35:31 | 1 |
| 2021-03-13 00:36:02 | 1 |
| 2021-03-13 00:36:32 | 1 |
| 2021-03-13 00:37:03 | 1 |
| 2021-03-13 00:37:34 | 1 |
| 2021-03-13 00:38:05 | 1 |
| 2021-03-13 00:38:35 | 1 |
| 2021-03-13 00:39:06 | 1 |
| 2021-03-13 00:39:37 | 1 |
| 2021-03-13 00:40:07 | 1 |
| 2021-03-13 00:40:38 | 1 |
| 2021-03-13 00:41:09 | 1 |
| 2021-03-13 00:41:39 | 1 |
| 2021-03-13 00:42:10 | 1 |
| 2021-03-13 00:42:41 | 1 |
| 2021-03-13 00:43:11 | 1 |
| 2021-03-13 00:43:42 | 1 |
| 2021-03-13 00:44:13 | 1 |
| 2021-03-13 00:44:44 | 1 |
| 2021-03-13 00:45:14 | 1 |
| 2021-03-13 00:45:45 | 1 |
| 2021-03-13 00:46:16 | 1 |
| 2021-03-13 00:46:46 | 1 |
| 2021-03-13 00:47:17 | 1 |
| 2021-03-13 00:47:48 | 1 |
| 2021-03-13 00:48:18 | 1 |
| 2021-03-13 00:48:49 | 1 |
| 2021-03-13 00:49:20 | 1 |
| 2021-03-13 00:49:50 | 1 |
| 2021-03-13 00:50:21 | 1 |
| 2021-03-13 00:50:52 | 1 |
| 2021-03-13 00:51:23 | 1 |
| 2021-03-13 00:51:53 | 1 |
| 2021-03-13 00:52:24 | 1 |
| 2021-03-13 00:52:55 | 1 |
| 2021-03-13 00:53:25 | 1 |
| 2021-03-13 00:53:56 | 1 |
| 2021-03-13 00:54:27 | 1 |
| 2021-03-13 00:54:57 | 1 |
| 2021-03-13 00:55:28 | 1 |
| 2021-03-13 00:55:59 | 1 |
| 2021-03-13 00:56:29 | 1 |
| 2021-03-13 00:57:00 | 1 |
| 2021-03-13 00:57:31 | 1 |
| 2021-03-13 00:58:02 | 1 |
| 2021-03-13 00:58:32 | 1 |
| 2021-03-13 00:59:03 | 1 |
| 2021-03-13 00:59:34 | 1 |
| 2021-03-13 01:00:04 | 1 |
| 2021-03-13 01:00:35 | 1 |
| 2021-03-13 01:01:06 | 1 |
| 2021-03-13 01:01:36 | 1 |
| 2021-03-13 01:02:07 | 1 |
| 2021-03-13 01:02:38 | 1 |
| 2021-03-13 01:03:08 | 1 |
| 2021-03-13 01:03:39 | 1 |
| 2021-03-13 01:04:10 | 1 |
| 2021-03-13 01:04:41 | 1 |
| 2021-03-13 01:05:11 | 1 |
| 2021-03-13 01:05:42 | 1 |
| 2021-03-13 01:06:13 | 1 |
| 2021-03-13 01:06:43 | 1 |
| 2021-03-13 01:07:14 | 1 |
| 2021-03-13 01:07:45 | 1 |
| 2021-03-13 01:08:15 | 1 |
| 2021-03-13 01:08:46 | 1 |
| 2021-03-13 01:09:17 | 1 |
| 2021-03-13 01:09:47 | 1 |
| 2021-03-13 01:10:18 | 1 |
| 2021-03-13 01:10:49 | 1 |
| 2021-03-13 01:11:20 | 1 |
| 2021-03-13 01:11:50 | 1 |
| 2021-03-13 01:12:21 | 1 |
| 2021-03-13 01:12:52 | 1 |
| 2021-03-13 01:13:22 | 1 |
| 2021-03-13 01:13:53 | 1 |
| 2021-03-13 01:14:24 | 1 |
| 2021-03-13 01:14:54 | 1 |
| 2021-03-13 01:15:25 | 1 |
| 2021-03-13 01:15:56 | 1 |
| 2021-03-13 01:16:26 | 1 |
| 2021-03-13 01:16:57 | 1 |
| 2021-03-13 01:17:28 | 1 |
| 2021-03-13 01:17:59 | 1 |
| 2021-03-13 01:18:29 | 1 |
| 2021-03-13 01:19:00 | 1 |
| 2021-03-13 01:19:31 | 1 |
| 2021-03-13 01:20:01 | 1 |
| 2021-03-13 01:20:32 | 1 |
| 2021-03-13 01:21:03 | 1 |
| 2021-03-13 01:21:33 | 1 |
| 2021-03-13 01:22:04 | 1 |
| 2021-03-13 01:22:35 | 1 |
| 2021-03-13 01:23:06 | 1 |
| 2021-03-13 01:23:36 | 1 |
| 2021-03-13 01:24:07 | 1 |
| 2021-03-13 01:24:38 | 1 |
| 2021-03-13 01:25:08 | 1 |
| 2021-03-13 01:25:39 | 1 |
| 2021-03-13 01:26:10 | 1 |
| 2021-03-13 01:26:40 | 1 |
| 2021-03-13 01:27:11 | 1 |
| 2021-03-13 01:27:42 | 1 |
| 2021-03-13 01:28:12 | 1 |
| 2021-03-13 01:28:43 | 1 |
| 2021-03-13 01:29:14 | 1 |
| 2021-03-13 01:29:45 | 1 |
| 2021-03-13 01:30:15 | 1 |
| 2021-03-13 01:30:46 | 1 |
| 2021-03-13 01:31:17 | 1 |
| 2021-03-13 01:31:47 | 1 |
| 2021-03-13 01:32:18 | 1 |
| 2021-03-13 01:32:49 | 1 |
| 2021-03-13 01:33:19 | 1 |
| 2021-03-13 01:33:50 | 1 |
| 2021-03-13 01:34:21 | 1 |
| 2021-03-13 01:34:51 | 1 |
| 2021-03-13 01:35:22 | 1 |
| 2021-03-13 01:35:53 | 1 |
| 2021-03-13 01:36:24 | 1 |
| 2021-03-13 01:36:54 | 1 |
| 2021-03-13 01:37:25 | 1 |
| 2021-03-13 01:37:56 | 1 |
| 2021-03-13 01:38:26 | 1 |
| 2021-03-13 01:38:57 | 1 |
| 2021-03-13 01:39:28 | 1 |
| 2021-03-13 01:39:58 | 1 |
| 2021-03-13 01:40:29 | 1 |
| 2021-03-13 01:41:00 | 1 |
| 2021-03-13 01:41:30 | 1 |
| 2021-03-13 01:42:01 | 1 |
| 2021-03-13 01:42:32 | 1 |
| 2021-03-13 01:43:03 | 1 |
| 2021-03-13 01:43:33 | 1 |
| 2021-03-13 01:44:04 | 1 |
| 2021-03-13 01:44:35 | 1 |
| 2021-03-13 01:45:05 | 1 |
| 2021-03-13 01:45:36 | 1 |
| 2021-03-13 01:46:07 | 1 |
| 2021-03-13 01:46:37 | 1 |
| 2021-03-13 01:47:08 | 1 |
| 2021-03-13 01:47:39 | 1 |
| 2021-03-13 01:48:10 | 1 |
| 2021-03-13 01:48:40 | 1 |
| 2021-03-13 01:49:11 | 1 |
| 2021-03-13 01:49:42 | 1 |
| 2021-03-13 01:50:12 | 1 |
| 2021-03-13 01:50:43 | 1 |
| 2021-03-13 01:51:14 | 1 |
| 2021-03-13 01:51:44 | 1 |
| 2021-03-13 01:52:15 | 1 |
| 2021-03-13 01:52:46 | 1 |
| 2021-03-13 01:53:16 | 1 |
| 2021-03-13 01:53:47 | 1 |
| 2021-03-13 01:54:18 | 1 |
| 2021-03-13 01:54:49 | 1 |
| 2021-03-13 01:55:19 | 1 |
| 2021-03-13 01:55:50 | 1 |
| 2021-03-13 01:56:21 | 1 |
| 2021-03-13 01:56:51 | 1 |
| 2021-03-13 01:57:22 | 1 |
| 2021-03-13 01:57:53 | 1 |
| 2021-03-13 01:58:23 | 1 |
| 2021-03-13 01:58:54 | 1 |
| 2021-03-13 01:59:25 | 1 |
| 2021-03-13 01:59:56 | 1 |
| 2021-03-13 02:00:26 | 1 |
| 2021-03-13 02:00:57 | 1 |
| 2021-03-13 02:01:28 | 1 |
| 2021-03-13 02:01:58 | 1 |
| 2021-03-13 02:02:29 | 1 |
| 2021-03-13 02:03:00 | 1 |
| 2021-03-13 02:03:30 | 1 |
| 2021-03-13 02:04:01 | 1 |
| 2021-03-13 02:04:32 | 1 |
| 2021-03-13 02:05:02 | 1 |
| 2021-03-13 02:05:33 | 1 |
| 2021-03-13 02:06:04 | 1 |
| 2021-03-13 02:06:35 | 1 |
| 2021-03-13 02:07:05 | 1 |
| 2021-03-13 02:07:36 | 1 |
| 2021-03-13 02:08:07 | 1 |
| 2021-03-13 02:08:37 | 1 |
| 2021-03-13 02:09:08 | 1 |
| 2021-03-13 02:09:39 | 1 |
| 2021-03-13 02:10:09 | 1 |
| 2021-03-13 02:10:40 | 1 |
| 2021-03-13 02:11:11 | 1 |
| 2021-03-13 02:11:41 | 1 |
| 2021-03-13 02:12:12 | 1 |
| 2021-03-13 02:12:43 | 1 |
| 2021-03-13 02:13:14 | 1 |
| 2021-03-13 02:13:44 | 1 |
| 2021-03-13 02:14:15 | 1 |
| 2021-03-13 02:14:46 | 1 |
| 2021-03-13 02:15:16 | 1 |
| 2021-03-13 02:15:47 | 1 |
| 2021-03-13 02:16:18 | 1 |
| 2021-03-13 02:16:48 | 1 |
| 2021-03-13 02:17:19 | 1 |
| 2021-03-13 02:17:50 | 1 |
| 2021-03-13 02:18:21 | 1 |
| 2021-03-13 02:18:51 | 1 |
| 2021-03-13 02:19:22 | 1 |
| 2021-03-13 02:19:53 | 1 |
| 2021-03-13 02:20:23 | 1 |
| 2021-03-13 02:20:54 | 1 |
| 2021-03-13 02:21:25 | 1 |
| 2021-03-13 02:21:55 | 1 |
| 2021-03-13 02:22:26 | 1 |
| 2021-03-13 02:22:57 | 1 |
| 2021-03-13 02:23:27 | 1 |
| 2021-03-13 02:23:58 | 1 |
| 2021-03-13 02:24:29 | 1 |
| 2021-03-13 02:25:00 | 1 |
| 2021-03-13 02:25:30 | 1 |
| 2021-03-13 02:26:01 | 1 |
| 2021-03-13 02:26:32 | 1 |
| 2021-03-13 02:27:02 | 1 |
| 2021-03-13 02:27:33 | 1 |
| 2021-03-13 02:28:04 | 1 |
| 2021-03-13 02:28:34 | 1 |
| 2021-03-13 02:29:05 | 1 |
| 2021-03-13 02:29:36 | 1 |
| 2021-03-13 02:30:07 | 1 |
| 2021-03-13 02:30:37 | 1 |
| 2021-03-13 02:31:08 | 1 |
| 2021-03-13 02:31:39 | 1 |
| 2021-03-13 02:32:09 | 1 |
| 2021-03-13 02:32:40 | 1 |
| 2021-03-13 02:33:11 | 1 |
| 2021-03-13 02:33:41 | 1 |
| 2021-03-13 02:34:12 | 1 |
| 2021-03-13 02:34:43 | 1 |
| 2021-03-13 02:35:13 | 1 |
| 2021-03-13 02:35:44 | 1 |
| 2021-03-13 02:36:15 | 1 |
| 2021-03-13 02:36:46 | 1 |
| 2021-03-13 02:37:16 | 1 |
| 2021-03-13 02:37:47 | 1 |
| 2021-03-13 02:38:18 | 1 |
| 2021-03-13 02:38:48 | 1 |
| 2021-03-13 02:39:19 | 1 |
| 2021-03-13 02:39:50 | 1 |
| 2021-03-13 02:40:20 | 1 |
| 2021-03-13 02:40:51 | 1 |
| 2021-03-13 02:41:22 | 1 |
| 2021-03-13 02:41:53 | 1 |
| 2021-03-13 02:42:23 | 1 |
| 2021-03-13 02:42:54 | 1 |
| 2021-03-13 02:43:25 | 1 |
| 2021-03-13 02:43:55 | 1 |
| 2021-03-13 02:44:26 | 1 |
| 2021-03-13 02:44:57 | 1 |
| 2021-03-13 02:45:27 | 1 |
| 2021-03-13 02:45:58 | 1 |
| 2021-03-13 02:46:29 | 1 |
| 2021-03-13 02:47:00 | 1 |
| 2021-03-13 02:47:30 | 1 |
| 2021-03-13 02:48:01 | 1 |
| 2021-03-13 02:48:32 | 1 |
| 2021-03-13 02:49:02 | 1 |
| 2021-03-13 02:49:33 | 1 |
| 2021-03-13 02:50:04 | 1 |
| 2021-03-13 02:50:34 | 1 |
| 2021-03-13 02:51:05 | 1 |
| 2021-03-13 02:51:36 | 1 |
| 2021-03-13 02:52:06 | 1 |
| 2021-03-13 02:52:37 | 1 |
| 2021-03-13 02:53:08 | 1 |
| 2021-03-13 02:53:39 | 1 |
| 2021-03-13 02:54:09 | 1 |
| 2021-03-13 02:54:40 | 1 |
| 2021-03-13 02:55:11 | 1 |
| 2021-03-13 02:55:41 | 1 |
| 2021-03-13 02:56:12 | 1 |
| 2021-03-13 02:56:43 | 1 |
| 2021-03-13 02:57:13 | 1 |
| 2021-03-13 02:57:44 | 1 |
| 2021-03-13 02:58:15 | 1 |
| 2021-03-13 02:58:46 | 1 |
| 2021-03-13 02:59:16 | 1 |
| 2021-03-13 02:59:47 | 1 |
| 2021-03-13 03:00:18 | 1 |
| 2021-03-13 03:00:48 | 1 |
| 2021-03-13 03:01:19 | 1 |
| 2021-03-13 03:01:50 | 1 |
| 2021-03-13 03:02:20 | 1 |
| 2021-03-13 03:02:51 | 1 |
| 2021-03-13 03:03:22 | 1 |
| 2021-03-13 03:03:53 | 1 |
| 2021-03-13 03:04:23 | 1 |
| 2021-03-13 03:04:54 | 1 |
| 2021-03-13 03:05:25 | 1 |
| 2021-03-13 03:05:55 | 1 |
| 2021-03-13 03:06:26 | 1 |
| 2021-03-13 03:06:57 | 1 |
| 2021-03-13 03:07:27 | 1 |
| 2021-03-13 03:07:58 | 1 |
| 2021-03-13 03:08:29 | 1 |
| 2021-03-13 03:08:59 | 1 |
| 2021-03-13 03:09:30 | 1 |
| 2021-03-13 03:10:01 | 1 |
| 2021-03-13 03:10:32 | 1 |
| 2021-03-13 03:11:02 | 1 |
| 2021-03-13 03:11:33 | 1 |
| 2021-03-13 03:12:04 | 1 |
| 2021-03-13 03:12:34 | 1 |
| 2021-03-13 03:13:05 | 1 |
| 2021-03-13 03:13:36 | 1 |
| 2021-03-13 03:14:06 | 1 |
| 2021-03-13 03:14:37 | 1 |
| 2021-03-13 03:15:08 | 1 |
| 2021-03-13 03:15:39 | 1 |
| 2021-03-13 03:16:09 | 1 |
| 2021-03-13 03:16:40 | 1 |
| 2021-03-13 03:17:11 | 1 |
| 2021-03-13 03:17:41 | 1 |
| 2021-03-13 03:18:12 | 1 |
| 2021-03-13 03:18:43 | 1 |
| 2021-03-13 03:19:13 | 1 |
| 2021-03-13 03:19:44 | 1 |
| 2021-03-13 03:20:15 | 1 |
| 2021-03-13 03:20:45 | 1 |
| 2021-03-13 03:21:16 | 1 |
| 2021-03-13 03:21:47 | 1 |
| 2021-03-13 03:22:18 | 1 |
| 2021-03-13 03:22:48 | 1 |
| 2021-03-13 03:23:19 | 1 |
| 2021-03-13 03:23:50 | 1 |
| 2021-03-13 03:24:20 | 1 |
| 2021-03-13 03:24:51 | 1 |
| 2021-03-13 03:25:22 | 1 |
| 2021-03-13 03:25:52 | 1 |
| 2021-03-13 03:26:23 | 1 |
| 2021-03-13 03:26:54 | 1 |
| 2021-03-13 03:27:25 | 1 |
| 2021-03-13 03:27:55 | 1 |
| 2021-03-13 03:28:26 | 1 |
| 2021-03-13 03:28:57 | 1 |
| 2021-03-13 03:29:27 | 1 |
| 2021-03-13 03:29:58 | 1 |
| 2021-03-13 03:30:29 | 1 |
| 2021-03-13 03:30:59 | 1 |
| 2021-03-13 03:31:30 | 1 |
| 2021-03-13 03:32:01 | 1 |
| 2021-03-13 03:32:31 | 1 |
| 2021-03-13 03:33:02 | 1 |
| 2021-03-13 03:33:33 | 1 |
| 2021-03-13 03:34:04 | 1 |
| 2021-03-13 03:34:34 | 1 |
| 2021-03-13 03:35:05 | 1 |
| 2021-03-13 03:35:36 | 1 |
| 2021-03-13 03:36:06 | 1 |
| 2021-03-13 03:36:37 | 1 |
| 2021-03-13 03:37:08 | 1 |
| 2021-03-13 03:37:38 | 1 |
| 2021-03-13 03:38:09 | 1 |
| 2021-03-13 03:38:40 | 1 |
| 2021-03-13 03:39:11 | 1 |
| 2021-03-13 03:39:41 | 1 |
| 2021-03-13 03:40:12 | 1 |
| 2021-03-13 03:40:43 | 1 |
| 2021-03-13 03:41:13 | 1 |
| 2021-03-13 03:41:44 | 1 |
| 2021-03-13 03:42:15 | 1 |
| 2021-03-13 03:42:45 | 1 |
| 2021-03-13 03:43:16 | 1 |
| 2021-03-13 03:43:47 | 1 |
| 2021-03-13 03:44:17 | 1 |
| 2021-03-13 03:44:48 | 1 |
| 2021-03-13 03:45:19 | 1 |
| 2021-03-13 03:45:50 | 1 |
| 2021-03-13 03:46:20 | 1 |
| 2021-03-13 03:46:51 | 1 |
| 2021-03-13 03:47:22 | 1 |
| 2021-03-13 03:47:52 | 1 |
| 2021-03-13 03:48:23 | 1 |
| 2021-03-13 03:48:54 | 1 |
| 2021-03-13 03:49:24 | 1 |
| 2021-03-13 03:49:55 | 1 |
| 2021-03-13 03:50:26 | 1 |
| 2021-03-13 03:50:56 | 1 |
| 2021-03-13 03:51:27 | 1 |
| 2021-03-13 03:51:58 | 1 |
| 2021-03-13 03:52:29 | 1 |
| 2021-03-13 03:52:59 | 1 |
| 2021-03-13 03:53:30 | 1 |
| 2021-03-13 03:54:01 | 1 |
| 2021-03-13 03:54:31 | 1 |
| 2021-03-13 03:55:02 | 1 |
| 2021-03-13 03:55:33 | 1 |
| 2021-03-13 03:56:03 | 1 |
| 2021-03-13 03:56:34 | 1 |
| 2021-03-13 03:57:05 | 1 |
| 2021-03-13 03:57:36 | 1 |
| 2021-03-13 03:58:06 | 1 |
| 2021-03-13 03:58:37 | 1 |
| 2021-03-13 03:59:08 | 1 |
| 2021-03-13 03:59:38 | 1 |
| 2021-03-13 04:00:09 | 1 |
| 2021-03-13 04:00:40 | 1 |
| 2021-03-13 04:01:10 | 1 |
| 2021-03-13 04:01:41 | 1 |
| 2021-03-13 04:02:12 | 1 |
| 2021-03-13 04:02:42 | 1 |
| 2021-03-13 04:03:13 | 1 |
| 2021-03-13 04:03:44 | 1 |
| 2021-03-13 04:04:15 | 1 |
| 2021-03-13 04:04:45 | 1 |
| 2021-03-13 04:05:16 | 1 |
| 2021-03-13 04:05:47 | 1 |
| 2021-03-13 04:06:17 | 1 |
| 2021-03-13 04:06:48 | 1 |
| 2021-03-13 04:07:19 | 1 |
| 2021-03-13 04:07:49 | 1 |
| 2021-03-13 04:08:20 | 1 |
| 2021-03-13 04:08:51 | 1 |
| 2021-03-13 04:09:22 | 1 |
| 2021-03-13 04:09:52 | 1 |
| 2021-03-13 04:10:23 | 1 |
| 2021-03-13 04:10:54 | 1 |
| 2021-03-13 04:11:24 | 1 |
| 2021-03-13 04:11:55 | 1 |
| 2021-03-13 04:12:26 | 1 |
| 2021-03-13 04:12:56 | 1 |
| 2021-03-13 04:13:27 | 1 |
| 2021-03-13 04:13:58 | 1 |
| 2021-03-13 04:14:28 | 1 |
| 2021-03-13 04:14:59 | 1 |
| 2021-03-13 04:15:30 | 1 |
| 2021-03-13 04:16:01 | 1 |
| 2021-03-13 04:16:31 | 1 |
| 2021-03-13 04:17:02 | 1 |
| 2021-03-13 04:17:33 | 1 |
| 2021-03-13 04:18:03 | 1 |
| 2021-03-13 04:18:34 | 1 |
| 2021-03-13 04:19:05 | 1 |
| 2021-03-13 04:19:35 | 1 |
| 2021-03-13 04:20:06 | 1 |
| 2021-03-13 04:20:37 | 1 |
| 2021-03-13 04:21:08 | 1 |
| 2021-03-13 04:21:38 | 1 |
| 2021-03-13 04:22:09 | 1 |
| 2021-03-13 04:22:40 | 1 |
| 2021-03-13 04:23:10 | 1 |
| 2021-03-13 04:23:41 | 1 |
| 2021-03-13 04:24:12 | 1 |
| 2021-03-13 04:24:42 | 1 |
| 2021-03-13 04:25:13 | 1 |
| 2021-03-13 04:25:44 | 1 |
| 2021-03-13 04:26:14 | 1 |
| 2021-03-13 04:26:45 | 1 |
| 2021-03-13 04:27:16 | 1 |
| 2021-03-13 04:27:47 | 1 |
| 2021-03-13 04:28:17 | 1 |
| 2021-03-13 04:28:48 | 1 |
| 2021-03-13 04:29:19 | 1 |
| 2021-03-13 04:29:49 | 1 |
| 2021-03-13 04:30:20 | 1 |
| 2021-03-13 04:30:51 | 1 |
| 2021-03-13 04:31:21 | 1 |
| 2021-03-13 04:31:52 | 1 |
| 2021-03-13 04:32:23 | 1 |
| 2021-03-13 04:32:54 | 1 |
| 2021-03-13 04:33:24 | 1 |
| 2021-03-13 04:33:55 | 1 |
| 2021-03-13 04:34:26 | 1 |
| 2021-03-13 04:34:56 | 1 |
| 2021-03-13 04:35:27 | 1 |
| 2021-03-13 04:35:58 | 1 |
| 2021-03-13 04:36:28 | 1 |
| 2021-03-13 04:36:59 | 1 |
| 2021-03-13 04:37:30 | 1 |
| 2021-03-13 04:38:00 | 1 |
| 2021-03-13 04:38:31 | 1 |
| 2021-03-13 04:39:02 | 1 |
| 2021-03-13 04:39:33 | 1 |
| 2021-03-13 04:40:03 | 1 |
| 2021-03-13 04:40:34 | 1 |
| 2021-03-13 04:41:05 | 1 |
| 2021-03-13 04:41:35 | 1 |
| 2021-03-13 04:42:06 | 1 |
| 2021-03-13 04:42:37 | 1 |
| 2021-03-13 04:43:07 | 1 |
| 2021-03-13 04:43:38 | 1 |
| 2021-03-13 04:44:09 | 1 |
| 2021-03-13 04:44:40 | 1 |
| 2021-03-13 04:45:10 | 1 |
| 2021-03-13 04:45:41 | 1 |
| 2021-03-13 04:46:12 | 1 |
| 2021-03-13 04:46:42 | 1 |
| 2021-03-13 04:47:13 | 1 |
| 2021-03-13 04:47:44 | 1 |
| 2021-03-13 04:48:14 | 1 |
| 2021-03-13 04:48:45 | 1 |
| 2021-03-13 04:49:16 | 1 |
| 2021-03-13 04:49:46 | 1 |
| 2021-03-13 04:50:17 | 1 |
| 2021-03-13 04:50:48 | 1 |
| 2021-03-13 04:51:19 | 1 |
| 2021-03-13 04:51:49 | 1 |
| 2021-03-13 04:52:20 | 1 |
| 2021-03-13 04:52:51 | 1 |
| 2021-03-13 04:53:21 | 1 |
| 2021-03-13 04:53:52 | 1 |
| 2021-03-13 04:54:23 | 1 |
| 2021-03-13 04:54:53 | 1 |
| 2021-03-13 04:55:24 | 1 |
| 2021-03-13 04:55:55 | 1 |
| 2021-03-13 04:56:26 | 1 |
| 2021-03-13 04:56:56 | 1 |
| 2021-03-13 04:57:27 | 1 |
| 2021-03-13 04:57:58 | 1 |
| 2021-03-13 04:58:28 | 1 |
| 2021-03-13 04:58:59 | 1 |
| 2021-03-13 04:59:30 | 1 |
| 2021-03-13 05:00:00 | 1 |
| 2021-03-13 05:00:31 | 1 |
| 2021-03-13 05:01:02 | 1 |
| 2021-03-13 05:01:32 | 1 |
| 2021-03-13 05:02:03 | 1 |
| 2021-03-13 05:02:34 | 1 |
| 2021-03-13 05:03:05 | 1 |
| 2021-03-13 05:03:35 | 1 |
| 2021-03-13 05:04:06 | 1 |
| 2021-03-13 05:04:37 | 1 |
| 2021-03-13 05:05:07 | 1 |
| 2021-03-13 05:05:38 | 1 |
| 2021-03-13 05:06:09 | 1 |
| 2021-03-13 05:06:39 | 1 |
| 2021-03-13 05:07:10 | 1 |
| 2021-03-13 05:07:41 | 1 |
| 2021-03-13 05:08:12 | 1 |
| 2021-03-13 05:08:42 | 1 |
| 2021-03-13 05:09:13 | 1 |
| 2021-03-13 05:09:44 | 1 |
| 2021-03-13 05:10:14 | 1 |
| 2021-03-13 05:10:45 | 1 |
| 2021-03-13 05:11:16 | 1 |
| 2021-03-13 05:11:46 | 1 |
| 2021-03-13 05:12:17 | 1 |
| 2021-03-13 05:12:48 | 1 |
| 2021-03-13 05:13:19 | 1 |
| 2021-03-13 05:13:49 | 1 |
| 2021-03-13 05:14:20 | 1 |
| 2021-03-13 05:14:51 | 1 |
| 2021-03-13 05:15:21 | 1 |
| 2021-03-13 05:15:52 | 1 |
| 2021-03-13 05:16:23 | 1 |
| 2021-03-13 05:16:53 | 1 |
| 2021-03-13 05:17:24 | 1 |
| 2021-03-13 05:17:55 | 1 |
| 2021-03-13 05:18:25 | 1 |
| 2021-03-13 05:18:56 | 1 |
| 2021-03-13 05:19:27 | 1 |
| 2021-03-13 05:19:58 | 1 |
| 2021-03-13 05:20:28 | 1 |
| 2021-03-13 05:20:59 | 1 |
| 2021-03-13 05:21:30 | 1 |
| 2021-03-13 05:22:00 | 1 |
| 2021-03-13 05:22:31 | 1 |
| 2021-03-13 05:23:02 | 1 |
| 2021-03-13 05:23:32 | 1 |
| 2021-03-13 05:24:03 | 1 |
| 2021-03-13 05:24:34 | 1 |
| 2021-03-13 05:25:05 | 1 |
| 2021-03-13 05:25:35 | 1 |
| 2021-03-13 05:26:06 | 1 |
| 2021-03-13 05:26:37 | 1 |
| 2021-03-13 05:27:07 | 1 |
| 2021-03-13 05:27:38 | 1 |
| 2021-03-13 05:28:09 | 1 |
| 2021-03-13 05:28:39 | 1 |
| 2021-03-13 05:29:10 | 1 |
| 2021-03-13 05:29:41 | 1 |
| 2021-03-13 05:30:12 | 1 |
| 2021-03-13 05:30:42 | 1 |
| 2021-03-13 05:31:13 | 1 |
| 2021-03-13 05:31:44 | 1 |
| 2021-03-13 05:32:14 | 1 |
| 2021-03-13 05:32:45 | 1 |
| 2021-03-13 05:33:16 | 1 |
| 2021-03-13 05:33:46 | 1 |
| 2021-03-13 05:34:17 | 1 |
| 2021-03-13 05:34:48 | 1 |
| 2021-03-13 05:35:19 | 1 |
| 2021-03-13 05:35:49 | 1 |
| 2021-03-13 05:36:20 | 1 |
| 2021-03-13 05:36:51 | 1 |
| 2021-03-13 05:37:21 | 1 |
| 2021-03-13 05:37:52 | 1 |
| 2021-03-13 05:38:23 | 1 |
| 2021-03-13 05:38:53 | 1 |
| 2021-03-13 05:39:24 | 1 |
| 2021-03-13 05:39:55 | 1 |
| 2021-03-13 05:40:26 | 1 |
| 2021-03-13 05:40:56 | 1 |
| 2021-03-13 05:41:27 | 1 |
| 2021-03-13 05:41:58 | 1 |
| 2021-03-13 05:42:28 | 1 |
| 2021-03-13 05:42:59 | 1 |
| 2021-03-13 05:43:30 | 1 |
| 2021-03-13 05:44:00 | 1 |
| 2021-03-13 05:44:31 | 1 |
| 2021-03-13 05:45:02 | 1 |
| 2021-03-13 05:45:32 | 1 |
| 2021-03-13 05:46:03 | 1 |
| 2021-03-13 05:46:34 | 1 |
| 2021-03-13 05:47:05 | 1 |
| 2021-03-13 05:47:35 | 1 |
| 2021-03-13 05:48:06 | 1 |
| 2021-03-13 05:48:37 | 1 |
| 2021-03-13 05:49:07 | 1 |
| 2021-03-13 05:49:38 | 1 |
| 2021-03-13 05:50:09 | 1 |
| 2021-03-13 05:50:39 | 1 |
| 2021-03-13 05:51:10 | 1 |
| 2021-03-13 05:51:41 | 1 |
| 2021-03-13 05:52:12 | 1 |
| 2021-03-13 05:52:42 | 1 |
| 2021-03-13 05:53:13 | 1 |
| 2021-03-13 05:53:44 | 1 |
| 2021-03-13 05:54:14 | 1 |
| 2021-03-13 05:54:45 | 1 |
| 2021-03-13 05:55:16 | 1 |
| 2021-03-13 05:55:46 | 1 |
| 2021-03-13 05:56:17 | 1 |
| 2021-03-13 05:56:48 | 1 |
| 2021-03-13 05:57:19 | 1 |
| 2021-03-13 05:57:49 | 1 |
| 2021-03-13 05:58:20 | 1 |
| 2021-03-13 05:58:51 | 1 |
| 2021-03-13 05:59:21 | 1 |
| 2021-03-13 05:59:52 | 1 |
| 2021-03-13 06:00:23 | 1 |
| 2021-03-13 06:00:53 | 1 |
| 2021-03-13 06:01:24 | 1 |
| 2021-03-13 06:01:55 | 1 |
| 2021-03-13 06:02:26 | 1 |
| 2021-03-13 06:02:56 | 1 |
| 2021-03-13 06:03:27 | 1 |
| 2021-03-13 06:03:58 | 1 |
| 2021-03-13 06:04:28 | 1 |
| 2021-03-13 06:04:59 | 1 |
| 2021-03-13 06:05:30 | 1 |
| 2021-03-13 06:06:00 | 1 |
| 2021-03-13 06:06:31 | 1 |
| 2021-03-13 06:07:02 | 1 |
| 2021-03-13 06:07:33 | 1 |
| 2021-03-13 06:08:03 | 1 |
| 2021-03-13 06:08:34 | 1 |
| 2021-03-13 06:09:05 | 1 |
| 2021-03-13 06:09:35 | 1 |
| 2021-03-13 06:10:06 | 1 |
| 2021-03-13 06:10:37 | 1 |
| 2021-03-13 06:11:07 | 1 |
| 2021-03-13 06:11:38 | 1 |
| 2021-03-13 06:12:09 | 1 |
| 2021-03-13 06:12:40 | 1 |
| 2021-03-13 06:13:10 | 1 |
| 2021-03-13 06:13:41 | 1 |
| 2021-03-13 06:14:12 | 1 |
| 2021-03-13 06:14:42 | 1 |
| 2021-03-13 06:15:13 | 1 |
| 2021-03-13 06:15:44 | 1 |
| 2021-03-13 06:16:14 | 1 |
| 2021-03-13 06:16:45 | 1 |
| 2021-03-13 06:17:16 | 1 |
| 2021-03-13 06:17:46 | 1 |
| 2021-03-13 06:18:17 | 1 |
| 2021-03-13 06:18:48 | 1 |
| 2021-03-13 06:19:19 | 1 |
| 2021-03-13 06:19:49 | 1 |
| 2021-03-13 06:20:20 | 1 |
| 2021-03-13 06:20:51 | 1 |
| 2021-03-13 06:21:21 | 1 |
| 2021-03-13 06:21:52 | 1 |
| 2021-03-13 06:22:23 | 1 |
| 2021-03-13 06:22:53 | 1 |
| 2021-03-13 06:23:24 | 1 |
| 2021-03-13 06:23:55 | 1 |
| 2021-03-13 06:24:26 | 1 |
| 2021-03-13 06:24:56 | 1 |
| 2021-03-13 06:25:27 | 1 |
| 2021-03-13 06:25:58 | 1 |
| 2021-03-13 06:26:28 | 1 |
| 2021-03-13 06:26:59 | 1 |
| 2021-03-13 06:27:30 | 1 |
| 2021-03-13 06:28:00 | 1 |
| 2021-03-13 06:28:31 | 1 |
| 2021-03-13 06:29:02 | 1 |
| 2021-03-13 06:29:33 | 1 |
| 2021-03-13 06:30:03 | 1 |
| 2021-03-13 06:30:34 | 1 |
| 2021-03-13 06:31:05 | 1 |
| 2021-03-13 06:31:35 | 1 |
| 2021-03-13 06:32:06 | 1 |
| 2021-03-13 06:32:37 | 1 |
| 2021-03-13 06:33:07 | 1 |
| 2021-03-13 06:33:38 | 1 |
| 2021-03-13 06:34:09 | 1 |
| 2021-03-13 06:34:40 | 1 |
| 2021-03-13 06:35:10 | 1 |
| 2021-03-13 06:35:41 | 1 |
| 2021-03-13 06:36:12 | 1 |
| 2021-03-13 06:36:42 | 1 |
| 2021-03-13 06:37:13 | 1 |
| 2021-03-13 06:37:44 | 1 |
| 2021-03-13 06:38:14 | 1 |
| 2021-03-13 06:38:45 | 1 |
| 2021-03-13 06:39:16 | 1 |
| 2021-03-13 06:39:47 | 1 |
| 2021-03-13 06:40:17 | 1 |
| 2021-03-13 06:40:48 | 1 |
| 2021-03-13 06:41:19 | 1 |
| 2021-03-13 06:41:49 | 1 |
| 2021-03-13 06:42:20 | 1 |
| 2021-03-13 06:42:51 | 1 |
| 2021-03-13 06:43:21 | 1 |
| 2021-03-13 06:43:52 | 1 |
| 2021-03-13 06:44:23 | 1 |
| 2021-03-13 06:44:54 | 1 |
| 2021-03-13 06:45:24 | 1 |
| 2021-03-13 06:45:55 | 1 |
| 2021-03-13 06:46:26 | 1 |
| 2021-03-13 06:46:56 | 1 |
| 2021-03-13 06:47:27 | 1 |
| 2021-03-13 06:47:58 | 1 |
| 2021-03-13 06:48:28 | 1 |
| 2021-03-13 06:48:59 | 1 |
| 2021-03-13 06:49:30 | 1 |
| 2021-03-13 06:50:00 | 1 |
| 2021-03-13 06:50:31 | 1 |
| 2021-03-13 06:51:02 | 1 |
| 2021-03-13 06:51:33 | 1 |
| 2021-03-13 06:52:03 | 1 |
| 2021-03-13 06:52:34 | 1 |
| 2021-03-13 06:53:05 | 1 |
| 2021-03-13 06:53:35 | 1 |
| 2021-03-13 06:54:06 | 1 |
| 2021-03-13 06:54:37 | 1 |
| 2021-03-13 06:55:07 | 1 |
| 2021-03-13 06:55:38 | 1 |
| 2021-03-13 06:56:09 | 1 |
| 2021-03-13 06:56:40 | 1 |
| 2021-03-13 06:57:10 | 1 |
| 2021-03-13 06:57:41 | 1 |
| 2021-03-13 06:58:12 | 1 |
| 2021-03-13 06:58:42 | 1 |
| 2021-03-13 06:59:13 | 1 |
| 2021-03-13 06:59:44 | 1 |
| 2021-03-13 07:00:14 | 1 |
| 2021-03-13 07:00:45 | 1 |
| 2021-03-13 07:01:16 | 1 |
| 2021-03-13 07:01:47 | 1 |
| 2021-03-13 07:02:17 | 1 |
| 2021-03-13 07:02:48 | 1 |
| 2021-03-13 07:03:19 | 1 |
| 2021-03-13 07:03:49 | 1 |
| 2021-03-13 07:04:20 | 1 |
| 2021-03-13 07:04:51 | 1 |
| 2021-03-13 07:05:21 | 1 |
| 2021-03-13 07:05:52 | 1 |
| 2021-03-13 07:06:23 | 1 |
| 2021-03-13 07:06:53 | 1 |
| 2021-03-13 07:07:24 | 1 |
| 2021-03-13 07:07:55 | 1 |
| 2021-03-13 07:08:26 | 1 |
| 2021-03-13 07:08:56 | 1 |
| 2021-03-13 07:09:27 | 1 |
| 2021-03-13 07:09:58 | 1 |
| 2021-03-13 07:10:28 | 1 |
| 2021-03-13 07:10:59 | 1 |
| 2021-03-13 07:11:30 | 1 |
| 2021-03-13 07:12:00 | 1 |
| 2021-03-13 07:12:31 | 1 |
| 2021-03-13 07:13:02 | 1 |
| 2021-03-13 07:13:33 | 1 |
| 2021-03-13 07:14:03 | 1 |
| 2021-03-13 07:14:34 | 1 |
| 2021-03-13 07:15:05 | 1 |
| 2021-03-13 07:15:35 | 1 |
| 2021-03-13 07:16:06 | 1 |
| 2021-03-13 07:16:37 | 1 |
| 2021-03-13 07:17:07 | 1 |
| 2021-03-13 07:17:38 | 1 |
| 2021-03-13 07:18:09 | 1 |
| 2021-03-13 07:18:40 | 1 |
| 2021-03-13 07:19:10 | 1 |
| 2021-03-13 07:19:41 | 1 |
| 2021-03-13 07:20:12 | 1 |
| 2021-03-13 07:20:42 | 1 |
| 2021-03-13 07:21:13 | 1 |
| 2021-03-13 07:21:44 | 1 |
| 2021-03-13 07:22:14 | 1 |
| 2021-03-13 07:22:45 | 1 |
| 2021-03-13 07:23:16 | 1 |
| 2021-03-13 07:23:46 | 1 |
| 2021-03-13 07:24:17 | 1 |
| 2021-03-13 07:24:48 | 1 |
| 2021-03-13 07:25:19 | 1 |
| 2021-03-13 07:25:49 | 1 |
| 2021-03-13 07:26:20 | 1 |
| 2021-03-13 07:26:51 | 1 |
| 2021-03-13 07:27:21 | 1 |
| 2021-03-13 07:27:52 | 1 |
| 2021-03-13 07:28:23 | 1 |
| 2021-03-13 07:28:53 | 1 |
| 2021-03-13 07:29:24 | 1 |
| 2021-03-13 07:29:55 | 1 |
| 2021-03-13 07:30:26 | 1 |
| 2021-03-13 07:30:56 | 1 |
| 2021-03-13 07:31:27 | 1 |
| 2021-03-13 07:31:58 | 1 |
| 2021-03-13 07:32:28 | 1 |
| 2021-03-13 07:32:59 | 1 |
| 2021-03-13 07:33:30 | 1 |
| 2021-03-13 07:34:00 | 1 |
| 2021-03-13 07:34:31 | 1 |
| 2021-03-13 07:35:02 | 1 |
| 2021-03-13 07:35:33 | 1 |
| 2021-03-13 07:36:03 | 1 |
| 2021-03-13 07:36:34 | 1 |
| 2021-03-13 07:37:05 | 1 |
| 2021-03-13 07:37:35 | 1 |
| 2021-03-13 07:38:06 | 1 |
| 2021-03-13 07:38:37 | 1 |
| 2021-03-13 07:39:07 | 1 |
| 2021-03-13 07:39:38 | 1 |
| 2021-03-13 07:40:09 | 1 |
| 2021-03-13 07:40:39 | 1 |
| 2021-03-13 07:41:10 | 1 |
| 2021-03-13 07:41:41 | 1 |
| 2021-03-13 07:42:12 | 1 |
| 2021-03-13 07:42:42 | 1 |
| 2021-03-13 07:43:13 | 1 |
| 2021-03-13 07:43:44 | 1 |
| 2021-03-13 07:44:14 | 1 |
| 2021-03-13 07:44:45 | 1 |
| 2021-03-13 07:45:16 | 1 |
| 2021-03-13 07:45:46 | 1 |
| 2021-03-13 07:46:17 | 1 |
| 2021-03-13 07:46:48 | 1 |
| 2021-03-13 07:47:19 | 1 |
| 2021-03-13 07:47:49 | 1 |
| 2021-03-13 07:48:20 | 1 |
| 2021-03-13 07:48:51 | 1 |
| 2021-03-13 07:49:21 | 1 |
| 2021-03-13 07:49:52 | 1 |
| 2021-03-13 07:50:23 | 1 |
| 2021-03-13 07:50:53 | 1 |
| 2021-03-13 07:51:24 | 1 |
| 2021-03-13 07:51:55 | 1 |
| 2021-03-13 07:52:25 | 1 |
| 2021-03-13 07:52:56 | 1 |
| 2021-03-13 07:53:27 | 1 |
| 2021-03-13 07:53:58 | 1 |
| 2021-03-13 07:54:28 | 1 |
| 2021-03-13 07:54:59 | 1 |
| 2021-03-13 07:55:30 | 1 |
| 2021-03-13 07:56:00 | 1 |
| 2021-03-13 07:56:31 | 1 |
| 2021-03-13 07:57:02 | 1 |
| 2021-03-13 07:57:32 | 1 |
| 2021-03-13 07:58:03 | 1 |
| 2021-03-13 07:58:34 | 1 |
| 2021-03-13 07:59:05 | 1 |
| 2021-03-13 07:59:35 | 1 |
| 2021-03-13 08:00:06 | 1 |
| 2021-03-13 08:00:37 | 1 |
| 2021-03-13 08:01:07 | 1 |
| 2021-03-13 08:01:38 | 1 |
| 2021-03-13 08:02:09 | 1 |
| 2021-03-13 08:02:39 | 1 |
| 2021-03-13 08:03:10 | 1 |
| 2021-03-13 08:03:41 | 1 |
| 2021-03-13 08:04:11 | 1 |
| 2021-03-13 08:04:42 | 1 |
| 2021-03-13 08:05:13 | 1 |
| 2021-03-13 08:05:44 | 1 |
| 2021-03-13 08:06:14 | 1 |
| 2021-03-13 08:06:45 | 1 |
| 2021-03-13 08:07:16 | 1 |
| 2021-03-13 08:07:46 | 1 |
| 2021-03-13 08:08:17 | 1 |
| 2021-03-13 08:08:48 | 1 |
| 2021-03-13 08:09:18 | 1 |
| 2021-03-13 08:09:49 | 1 |
| 2021-03-13 08:10:20 | 1 |
| 2021-03-13 08:10:51 | 1 |
| 2021-03-13 08:11:21 | 1 |
| 2021-03-13 08:11:52 | 1 |
| 2021-03-13 08:12:23 | 1 |
| 2021-03-13 08:12:53 | 1 |
| 2021-03-13 08:13:24 | 1 |
| 2021-03-13 08:13:55 | 1 |
| 2021-03-13 08:14:25 | 1 |
| 2021-03-13 08:14:56 | 1 |
| 2021-03-13 08:15:27 | 1 |
| 2021-03-13 08:15:57 | 1 |
| 2021-03-13 08:16:28 | 1 |
| 2021-03-13 08:16:59 | 1 |
| 2021-03-13 08:17:30 | 1 |
| 2021-03-13 08:18:00 | 1 |
| 2021-03-13 08:18:31 | 1 |
| 2021-03-13 08:19:02 | 1 |
| 2021-03-13 08:19:32 | 1 |
| 2021-03-13 08:20:03 | 1 |
| 2021-03-13 08:20:34 | 1 |
| 2021-03-13 08:21:04 | 1 |
| 2021-03-13 08:21:35 | 1 |
| 2021-03-13 08:22:06 | 1 |
| 2021-03-13 08:22:36 | 1 |
| 2021-03-13 08:23:07 | 1 |
| 2021-03-13 08:23:38 | 1 |
| 2021-03-13 08:24:09 | 1 |
| 2021-03-13 08:24:39 | 1 |
| 2021-03-13 08:25:10 | 1 |
| 2021-03-13 08:25:41 | 1 |
| 2021-03-13 08:26:11 | 1 |
| 2021-03-13 08:26:42 | 1 |
| 2021-03-13 08:27:13 | 1 |
| 2021-03-13 08:27:43 | 1 |
| 2021-03-13 08:28:14 | 1 |
| 2021-03-13 08:28:45 | 1 |
| 2021-03-13 08:29:16 | 1 |
| 2021-03-13 08:29:46 | 1 |
| 2021-03-13 08:30:17 | 1 |
| 2021-03-13 08:30:48 | 1 |
| 2021-03-13 08:31:18 | 1 |
| 2021-03-13 08:31:49 | 1 |
| 2021-03-13 08:32:20 | 1 |
| 2021-03-13 08:32:50 | 1 |
| 2021-03-13 08:33:21 | 1 |
| 2021-03-13 08:33:52 | 1 |
| 2021-03-13 08:34:23 | 1 |
| 2021-03-13 08:34:53 | 1 |
| 2021-03-13 08:35:24 | 1 |
| 2021-03-13 08:35:55 | 1 |
| 2021-03-13 08:36:25 | 1 |
| 2021-03-13 08:36:56 | 1 |
| 2021-03-13 08:37:27 | 1 |
| 2021-03-13 08:37:57 | 1 |
| 2021-03-13 08:38:28 | 1 |
| 2021-03-13 08:38:59 | 1 |
| 2021-03-13 08:39:29 | 1 |
| 2021-03-13 08:40:00 | 1 |
| 2021-03-13 08:40:31 | 1 |
| 2021-03-13 08:41:02 | 1 |
| 2021-03-13 08:41:32 | 1 |
| 2021-03-13 08:42:03 | 1 |
| 2021-03-13 08:42:34 | 1 |
| 2021-03-13 08:43:04 | 1 |
| 2021-03-13 08:43:35 | 1 |
| 2021-03-13 08:44:06 | 1 |
| 2021-03-13 08:44:36 | 1 |
| 2021-03-13 08:45:07 | 1 |
| 2021-03-13 08:45:38 | 1 |
| 2021-03-13 08:46:08 | 1 |
| 2021-03-13 08:46:39 | 1 |
| 2021-03-13 08:47:10 | 1 |
| 2021-03-13 08:47:41 | 1 |
| 2021-03-13 08:48:11 | 1 |
| 2021-03-13 08:48:42 | 1 |
| 2021-03-13 08:49:13 | 1 |
| 2021-03-13 08:49:43 | 1 |
| 2021-03-13 08:50:14 | 1 |
| 2021-03-13 08:50:45 | 1 |
| 2021-03-13 08:51:15 | 1 |
| 2021-03-13 08:51:46 | 1 |
| 2021-03-13 08:52:17 | 1 |
| 2021-03-13 08:52:47 | 1 |
| 2021-03-13 08:53:18 | 1 |
| 2021-03-13 08:53:49 | 1 |
| 2021-03-13 08:54:20 | 1 |
| 2021-03-13 08:54:50 | 1 |
| 2021-03-13 08:55:21 | 1 |
| 2021-03-13 08:55:52 | 1 |
| 2021-03-13 08:56:22 | 1 |
| 2021-03-13 08:56:53 | 1 |
| 2021-03-13 08:57:24 | 1 |
| 2021-03-13 08:57:54 | 1 |
| 2021-03-13 08:58:25 | 1 |
| 2021-03-13 08:58:56 | 1 |
| 2021-03-13 08:59:26 | 1 |
| 2021-03-13 08:59:57 | 1 |
| 2021-03-13 09:00:28 | 1 |
| 2021-03-13 09:00:59 | 1 |
| 2021-03-13 09:01:29 | 1 |
| 2021-03-13 09:02:00 | 1 |
| 2021-03-13 09:02:31 | 1 |
| 2021-03-13 09:03:01 | 1 |
| 2021-03-13 09:03:32 | 1 |
| 2021-03-13 09:04:03 | 1 |
| 2021-03-13 09:04:33 | 1 |
| 2021-03-13 09:05:04 | 1 |
| 2021-03-13 09:05:35 | 1 |
| 2021-03-13 09:06:06 | 1 |
| 2021-03-13 09:06:36 | 1 |
| 2021-03-13 09:07:07 | 1 |
| 2021-03-13 09:07:38 | 1 |
| 2021-03-13 09:08:08 | 1 |
| 2021-03-13 09:08:39 | 1 |
| 2021-03-13 09:09:10 | 1 |
| 2021-03-13 09:09:40 | 1 |
| 2021-03-13 09:10:11 | 1 |
| 2021-03-13 09:10:42 | 1 |
| 2021-03-13 09:11:13 | 1 |
| 2021-03-13 09:11:43 | 1 |
| 2021-03-13 09:12:14 | 1 |
| 2021-03-13 09:12:45 | 1 |
| 2021-03-13 09:13:15 | 1 |
| 2021-03-13 09:13:46 | 1 |
| 2021-03-13 09:14:17 | 1 |
| 2021-03-13 09:14:47 | 1 |
| 2021-03-13 09:15:18 | 1 |
| 2021-03-13 09:15:49 | 1 |
| 2021-03-13 09:16:19 | 1 |
| 2021-03-13 09:16:50 | 1 |
| 2021-03-13 09:17:21 | 1 |
| 2021-03-13 09:17:52 | 1 |
| 2021-03-13 09:18:22 | 1 |
| 2021-03-13 09:18:53 | 1 |
| 2021-03-13 09:19:24 | 1 |
| 2021-03-13 09:19:54 | 1 |
| 2021-03-13 09:20:25 | 1 |
| 2021-03-13 09:20:56 | 1 |
| 2021-03-13 09:21:26 | 1 |
| 2021-03-13 09:21:57 | 1 |
| 2021-03-13 09:22:28 | 1 |
| 2021-03-13 09:22:59 | 1 |
| 2021-03-13 09:23:29 | 1 |
| 2021-03-13 09:24:00 | 1 |
| 2021-03-13 09:24:31 | 1 |
| 2021-03-13 09:25:01 | 1 |
| 2021-03-13 09:25:32 | 1 |
| 2021-03-13 09:26:03 | 1 |
| 2021-03-13 09:26:33 | 1 |
| 2021-03-13 09:27:04 | 1 |
| 2021-03-13 09:27:35 | 1 |
| 2021-03-13 09:28:05 | 1 |
| 2021-03-13 09:28:36 | 1 |
| 2021-03-13 09:29:07 | 1 |
| 2021-03-13 09:29:38 | 1 |
| 2021-03-13 09:30:08 | 1 |
| 2021-03-13 09:30:39 | 1 |
| 2021-03-13 09:31:10 | 1 |
| 2021-03-13 09:31:40 | 1 |
| 2021-03-13 09:32:11 | 1 |
| 2021-03-13 09:32:42 | 1 |
| 2021-03-13 09:33:12 | 1 |
| 2021-03-13 09:33:43 | 1 |
| 2021-03-13 09:34:14 | 1 |
| 2021-03-13 09:34:45 | 1 |
| 2021-03-13 09:35:15 | 1 |
| 2021-03-13 09:35:46 | 1 |
| 2021-03-13 09:36:17 | 1 |
| 2021-03-13 09:36:47 | 1 |
| 2021-03-13 09:37:18 | 1 |
| 2021-03-13 09:37:49 | 1 |
| 2021-03-13 09:38:19 | 1 |
| 2021-03-13 09:38:50 | 1 |
| 2021-03-13 09:39:21 | 1 |
| 2021-03-13 09:39:52 | 1 |
| 2021-03-13 09:40:22 | 1 |
| 2021-03-13 09:40:53 | 1 |
| 2021-03-13 09:41:24 | 1 |
| 2021-03-13 09:41:54 | 1 |
| 2021-03-13 09:42:25 | 1 |
| 2021-03-13 09:42:56 | 1 |
| 2021-03-13 09:43:26 | 1 |
| 2021-03-13 09:43:57 | 1 |
| 2021-03-13 09:44:28 | 1 |
| 2021-03-13 09:44:58 | 1 |
| 2021-03-13 09:45:29 | 1 |
| 2021-03-13 09:46:00 | 1 |
| 2021-03-13 09:46:31 | 1 |
| 2021-03-13 09:47:01 | 1 |
| 2021-03-13 09:47:32 | 1 |
| 2021-03-13 09:48:03 | 1 |
| 2021-03-13 09:48:33 | 1 |
| 2021-03-13 09:49:04 | 1 |
| 2021-03-13 09:49:35 | 1 |
| 2021-03-13 09:50:05 | 1 |
| 2021-03-13 09:50:36 | 1 |
| 2021-03-13 09:51:07 | 1 |
| 2021-03-13 09:51:38 | 1 |
| 2021-03-13 09:52:08 | 1 |
| 2021-03-13 09:52:39 | 1 |
| 2021-03-13 09:53:10 | 1 |
| 2021-03-13 09:53:40 | 1 |
| 2021-03-13 09:54:11 | 1 |
| 2021-03-13 09:54:42 | 1 |
| 2021-03-13 09:55:12 | 1 |
| 2021-03-13 09:55:43 | 1 |
| 2021-03-13 09:56:14 | 1 |
| 2021-03-13 09:56:44 | 1 |
| 2021-03-13 09:57:15 | 1 |
| 2021-03-13 09:57:46 | 1 |
| 2021-03-13 09:58:17 | 1 |
| 2021-03-13 09:58:47 | 1 |
| 2021-03-13 09:59:18 | 1 |
| 2021-03-13 09:59:49 | 1 |
| 2021-03-13 10:00:19 | 1 |
| 2021-03-13 10:00:50 | 1 |
| 2021-03-13 10:01:21 | 1 |
| 2021-03-13 10:01:51 | 1 |
| 2021-03-13 10:02:22 | 1 |
| 2021-03-13 10:02:53 | 1 |
| 2021-03-13 10:03:24 | 1 |
| 2021-03-13 10:03:54 | 1 |
| 2021-03-13 10:04:25 | 1 |
| 2021-03-13 10:04:56 | 1 |
| 2021-03-13 10:05:26 | 1 |
| 2021-03-13 10:05:57 | 1 |
| 2021-03-13 10:06:28 | 1 |
| 2021-03-13 10:06:58 | 1 |
| 2021-03-13 10:07:29 | 1 |
| 2021-03-13 10:08:00 | 1 |
| 2021-03-13 10:08:30 | 1 |
| 2021-03-13 10:09:01 | 1 |
| 2021-03-13 10:09:32 | 1 |
| 2021-03-13 10:10:03 | 1 |
| 2021-03-13 10:10:33 | 1 |
| 2021-03-13 10:11:04 | 1 |
| 2021-03-13 10:11:35 | 1 |
| 2021-03-13 10:12:05 | 1 |
| 2021-03-13 10:12:36 | 1 |
| 2021-03-13 10:13:07 | 1 |
| 2021-03-13 10:13:37 | 1 |
| 2021-03-13 10:14:08 | 1 |
| 2021-03-13 10:14:39 | 1 |
| 2021-03-13 10:15:10 | 1 |
| 2021-03-13 10:15:40 | 1 |
| 2021-03-13 10:16:11 | 1 |
| 2021-03-13 10:16:42 | 1 |
| 2021-03-13 10:17:12 | 1 |
| 2021-03-13 10:17:43 | 1 |
| 2021-03-13 10:18:14 | 1 |
| 2021-03-13 10:18:44 | 1 |
| 2021-03-13 10:19:15 | 1 |
| 2021-03-13 10:19:46 | 1 |
| 2021-03-13 10:20:16 | 1 |
| 2021-03-13 10:20:47 | 1 |
| 2021-03-13 10:21:18 | 1 |
| 2021-03-13 10:21:49 | 1 |
| 2021-03-13 10:22:19 | 1 |
| 2021-03-13 10:22:50 | 1 |
| 2021-03-13 10:23:21 | 1 |
| 2021-03-13 10:23:51 | 1 |
| 2021-03-13 10:24:22 | 1 |
| 2021-03-13 10:24:53 | 1 |
| 2021-03-13 10:25:23 | 1 |
| 2021-03-13 10:25:54 | 1 |
| 2021-03-13 10:26:25 | 1 |
| 2021-03-13 10:26:55 | 1 |
| 2021-03-13 10:27:26 | 1 |
| 2021-03-13 10:27:57 | 1 |
| 2021-03-13 10:28:28 | 1 |
| 2021-03-13 10:28:58 | 1 |
| 2021-03-13 10:29:29 | 1 |
| 2021-03-13 10:30:00 | 1 |
| 2021-03-13 10:30:30 | 1 |
| 2021-03-13 10:31:01 | 1 |
| 2021-03-13 10:31:32 | 1 |
| 2021-03-13 10:32:02 | 1 |
| 2021-03-13 10:32:33 | 1 |
| 2021-03-13 10:33:04 | 1 |
| 2021-03-13 10:33:34 | 1 |
| 2021-03-13 10:34:05 | 1 |
| 2021-03-13 10:34:36 | 1 |
| 2021-03-13 10:35:07 | 1 |
| 2021-03-13 10:35:37 | 1 |
| 2021-03-13 10:36:08 | 1 |
| 2021-03-13 10:36:39 | 1 |
| 2021-03-13 10:37:09 | 1 |
| 2021-03-13 10:37:40 | 1 |
| 2021-03-13 10:38:11 | 1 |
| 2021-03-13 10:38:41 | 1 |
| 2021-03-13 10:39:12 | 1 |
| 2021-03-13 10:39:43 | 1 |
| 2021-03-13 10:40:13 | 1 |
| 2021-03-13 10:40:44 | 1 |
| 2021-03-13 10:41:15 | 1 |
| 2021-03-13 10:41:46 | 1 |
| 2021-03-13 10:42:16 | 1 |
| 2021-03-13 10:42:47 | 1 |
| 2021-03-13 10:43:18 | 1 |
| 2021-03-13 10:43:48 | 1 |
| 2021-03-13 10:44:19 | 1 |
| 2021-03-13 10:44:50 | 1 |
| 2021-03-13 10:45:20 | 1 |
| 2021-03-13 10:45:51 | 1 |
| 2021-03-13 10:46:22 | 1 |
| 2021-03-13 10:46:52 | 1 |
| 2021-03-13 10:47:23 | 1 |
| 2021-03-13 10:47:54 | 1 |
| 2021-03-13 10:48:25 | 1 |
| 2021-03-13 10:48:55 | 1 |
| 2021-03-13 10:49:26 | 1 |
| 2021-03-13 10:49:57 | 1 |
| 2021-03-13 10:50:27 | 1 |
| 2021-03-13 10:50:58 | 1 |
| 2021-03-13 10:51:29 | 1 |
| 2021-03-13 10:51:59 | 1 |
| 2021-03-13 10:52:30 | 1 |
| 2021-03-13 10:53:01 | 1 |
| 2021-03-13 10:53:32 | 1 |
| 2021-03-13 10:54:02 | 1 |
| 2021-03-13 10:54:33 | 1 |
| 2021-03-13 10:55:04 | 1 |
| 2021-03-13 10:55:34 | 1 |
| 2021-03-13 10:56:05 | 1 |
| 2021-03-13 10:56:36 | 1 |
| 2021-03-13 10:57:06 | 1 |
| 2021-03-13 10:57:37 | 1 |
| 2021-03-13 10:58:08 | 1 |
| 2021-03-13 10:58:38 | 1 |
| 2021-03-13 10:59:09 | 1 |
| 2021-03-13 10:59:40 | 1 |
| 2021-03-13 11:00:11 | 1 |
| 2021-03-13 11:00:41 | 1 |
| 2021-03-13 11:01:12 | 1 |
| 2021-03-13 11:01:43 | 1 |
| 2021-03-13 11:02:13 | 1 |
| 2021-03-13 11:02:44 | 1 |
| 2021-03-13 11:03:15 | 1 |
| 2021-03-13 11:03:45 | 1 |
| 2021-03-13 11:04:16 | 1 |
| 2021-03-13 11:04:47 | 1 |
| 2021-03-13 11:05:17 | 1 |
| 2021-03-13 11:05:48 | 1 |
| 2021-03-13 11:06:19 | 1 |
| 2021-03-13 11:06:50 | 1 |
| 2021-03-13 11:07:20 | 1 |
| 2021-03-13 11:07:51 | 1 |
| 2021-03-13 11:08:22 | 1 |
| 2021-03-13 11:08:52 | 1 |
| 2021-03-13 11:09:23 | 1 |
| 2021-03-13 11:09:54 | 1 |
| 2021-03-13 11:10:24 | 1 |
| 2021-03-13 11:10:55 | 1 |
| 2021-03-13 11:11:26 | 1 |
| 2021-03-13 11:11:56 | 1 |
| 2021-03-13 11:12:27 | 1 |
| 2021-03-13 11:12:58 | 1 |
| 2021-03-13 11:13:29 | 1 |
| 2021-03-13 11:13:59 | 1 |
| 2021-03-13 11:14:30 | 1 |
| 2021-03-13 11:15:01 | 1 |
| 2021-03-13 11:15:31 | 1 |
| 2021-03-13 11:16:02 | 1 |
| 2021-03-13 11:16:33 | 1 |
| 2021-03-13 11:17:03 | 1 |
| 2021-03-13 11:17:34 | 1 |
| 2021-03-13 11:18:05 | 1 |
| 2021-03-13 11:18:35 | 1 |
| 2021-03-13 11:19:06 | 1 |
| 2021-03-13 11:19:37 | 1 |
| 2021-03-13 11:20:08 | 1 |
| 2021-03-13 11:20:38 | 1 |
| 2021-03-13 11:21:09 | 1 |
| 2021-03-13 11:21:40 | 1 |
| 2021-03-13 11:22:10 | 1 |
| 2021-03-13 11:22:41 | 1 |
| 2021-03-13 11:23:12 | 1 |
| 2021-03-13 11:23:42 | 1 |
| 2021-03-13 11:24:13 | 1 |
| 2021-03-13 11:24:44 | 1 |
| 2021-03-13 11:25:14 | 1 |
| 2021-03-13 11:25:45 | 1 |
| 2021-03-13 11:26:16 | 1 |
| 2021-03-13 11:26:47 | 1 |
| 2021-03-13 11:27:17 | 1 |
| 2021-03-13 11:27:48 | 1 |
| 2021-03-13 11:28:19 | 1 |
| 2021-03-13 11:28:49 | 1 |
| 2021-03-13 11:29:20 | 1 |
| 2021-03-13 11:29:51 | 1 |
| 2021-03-13 11:30:21 | 1 |
| 2021-03-13 11:30:52 | 1 |
| 2021-03-13 11:31:23 | 1 |
| 2021-03-13 11:31:53 | 1 |
| 2021-03-13 11:32:24 | 1 |
| 2021-03-13 11:32:55 | 1 |
| 2021-03-13 11:33:26 | 1 |
| 2021-03-13 11:33:56 | 1 |
| 2021-03-13 11:34:27 | 1 |
| 2021-03-13 11:34:58 | 1 |
| 2021-03-13 11:35:28 | 1 |
| 2021-03-13 11:35:59 | 1 |
| 2021-03-13 11:36:30 | 1 |
| 2021-03-13 11:37:00 | 1 |
| 2021-03-13 11:37:31 | 1 |
| 2021-03-13 11:38:02 | 1 |
| 2021-03-13 11:38:32 | 1 |
| 2021-03-13 11:39:03 | 1 |
| 2021-03-13 11:39:34 | 1 |
| 2021-03-13 11:40:05 | 1 |
| 2021-03-13 11:40:35 | 1 |
| 2021-03-13 11:41:06 | 1 |
| 2021-03-13 11:41:37 | 1 |
| 2021-03-13 11:42:07 | 1 |
| 2021-03-13 11:42:38 | 1 |
| 2021-03-13 11:43:09 | 1 |
| 2021-03-13 11:43:39 | 1 |
| 2021-03-13 11:44:10 | 1 |
| 2021-03-13 11:44:41 | 1 |
| 2021-03-13 11:45:11 | 1 |
| 2021-03-13 11:45:42 | 1 |
| 2021-03-13 11:46:13 | 1 |
| 2021-03-13 11:46:44 | 1 |
| 2021-03-13 11:47:14 | 1 |
| 2021-03-13 11:47:45 | 1 |
| 2021-03-13 11:48:16 | 1 |
| 2021-03-13 11:48:46 | 1 |
| 2021-03-13 11:49:17 | 1 |
| 2021-03-13 11:49:48 | 1 |
| 2021-03-13 11:50:18 | 1 |
| 2021-03-13 11:50:49 | 1 |
| 2021-03-13 11:51:20 | 1 |
| 2021-03-13 11:51:51 | 1 |
| 2021-03-13 11:52:21 | 1 |
| 2021-03-13 11:52:52 | 1 |
| 2021-03-13 11:53:23 | 1 |
| 2021-03-13 11:53:53 | 1 |
| 2021-03-13 11:54:24 | 1 |
| 2021-03-13 11:54:55 | 1 |
| 2021-03-13 11:55:25 | 1 |
| 2021-03-13 11:55:56 | 1 |
| 2021-03-13 11:56:27 | 1 |
| 2021-03-13 11:56:57 | 1 |
| 2021-03-13 11:57:28 | 1 |
| 2021-03-13 11:57:59 | 1 |
| 2021-03-13 11:58:30 | 1 |
| 2021-03-13 11:59:00 | 1 |
| 2021-03-13 11:59:31 | 1 |
| 2021-03-13 12:00:02 | 1 |
| 2021-03-13 12:00:32 | 1 |
| 2021-03-13 12:01:03 | 1 |
| 2021-03-13 12:01:34 | 1 |
| 2021-03-13 12:02:04 | 1 |
| 2021-03-13 12:02:35 | 1 |
| 2021-03-13 12:03:06 | 1 |
| 2021-03-13 12:03:37 | 1 |
| 2021-03-13 12:04:07 | 1 |
| 2021-03-13 12:04:38 | 1 |
| 2021-03-13 12:05:09 | 1 |
| 2021-03-13 12:05:39 | 1 |
| 2021-03-13 12:06:10 | 1 |
| 2021-03-13 12:06:41 | 1 |
| 2021-03-13 12:07:11 | 1 |
| 2021-03-13 12:07:42 | 1 |
| 2021-03-13 12:08:13 | 1 |
| 2021-03-13 12:08:43 | 1 |
| 2021-03-13 12:09:14 | 1 |
| 2021-03-13 12:09:45 | 1 |
| 2021-03-13 12:10:16 | 1 |
| 2021-03-13 12:10:46 | 1 |
| 2021-03-13 12:11:17 | 1 |
| 2021-03-13 12:11:48 | 1 |
| 2021-03-13 12:12:18 | 1 |
| 2021-03-13 12:12:49 | 1 |
| 2021-03-13 12:13:20 | 1 |
| 2021-03-13 12:13:50 | 1 |
| 2021-03-13 12:14:21 | 1 |
| 2021-03-13 12:14:52 | 1 |
| 2021-03-13 12:15:22 | 1 |
| 2021-03-13 12:15:53 | 1 |
| 2021-03-13 12:16:24 | 1 |
| 2021-03-13 12:16:55 | 1 |
| 2021-03-13 12:17:25 | 1 |
| 2021-03-13 12:17:56 | 1 |
| 2021-03-13 12:18:27 | 1 |
| 2021-03-13 12:18:57 | 1 |
| 2021-03-13 12:19:28 | 1 |
| 2021-03-13 12:19:59 | 1 |
| 2021-03-13 12:20:29 | 1 |
| 2021-03-13 12:21:00 | 1 |
| 2021-03-13 12:21:31 | 1 |
| 2021-03-13 12:22:01 | 1 |
| 2021-03-13 12:22:32 | 1 |
| 2021-03-13 12:23:03 | 1 |
| 2021-03-13 12:23:34 | 1 |
| 2021-03-13 12:24:04 | 1 |
| 2021-03-13 12:24:35 | 1 |
| 2021-03-13 12:25:06 | 1 |
| 2021-03-13 12:25:36 | 1 |
| 2021-03-13 12:26:07 | 1 |
| 2021-03-13 12:26:38 | 1 |
| 2021-03-13 12:27:08 | 1 |
| 2021-03-13 12:27:39 | 1 |
| 2021-03-13 12:28:10 | 1 |
| 2021-03-13 12:28:41 | 1 |
| 2021-03-13 12:29:11 | 1 |
| 2021-03-13 12:29:42 | 1 |
| 2021-03-13 12:30:13 | 1 |
| 2021-03-13 12:30:43 | 1 |
| 2021-03-13 12:31:14 | 1 |
| 2021-03-13 12:31:45 | 1 |
| 2021-03-13 12:32:15 | 1 |
| 2021-03-13 12:32:46 | 1 |
| 2021-03-13 12:33:17 | 1 |
| 2021-03-13 12:33:47 | 1 |
| 2021-03-13 12:34:18 | 1 |
| 2021-03-13 12:34:49 | 1 |
| 2021-03-13 12:35:19 | 1 |
| 2021-03-13 12:35:50 | 1 |
| 2021-03-13 12:36:21 | 1 |
| 2021-03-13 12:36:52 | 1 |
| 2021-03-13 12:37:22 | 1 |
| 2021-03-13 12:37:53 | 1 |
| 2021-03-13 12:38:24 | 1 |
| 2021-03-13 12:38:54 | 1 |
| 2021-03-13 12:39:25 | 1 |
| 2021-03-13 12:39:56 | 1 |
| 2021-03-13 12:40:26 | 1 |
| 2021-03-13 12:40:57 | 1 |
| 2021-03-13 12:41:28 | 1 |
| 2021-03-13 12:41:59 | 1 |
| 2021-03-13 12:42:29 | 1 |
| 2021-03-13 12:43:00 | 1 |
| 2021-03-13 12:43:31 | 1 |
| 2021-03-13 12:44:01 | 1 |
| 2021-03-13 12:44:32 | 1 |
| 2021-03-13 12:45:03 | 1 |
| 2021-03-13 12:45:33 | 1 |
| 2021-03-13 12:46:04 | 1 |
| 2021-03-13 12:46:35 | 1 |
| 2021-03-13 12:47:05 | 1 |
| 2021-03-13 12:47:36 | 1 |
| 2021-03-13 12:48:07 | 1 |
| 2021-03-13 12:48:38 | 1 |
| 2021-03-13 12:49:08 | 1 |
| 2021-03-13 12:49:39 | 1 |
| 2021-03-13 12:50:10 | 1 |
| 2021-03-13 12:50:40 | 1 |
| 2021-03-13 12:51:11 | 1 |
| 2021-03-13 12:51:42 | 1 |
| 2021-03-13 12:52:12 | 1 |
| 2021-03-13 12:52:43 | 1 |
| 2021-03-13 12:53:14 | 1 |
| 2021-03-13 12:53:44 | 1 |
| 2021-03-13 12:54:15 | 1 |
| 2021-03-13 12:54:46 | 1 |
| 2021-03-13 12:55:17 | 1 |
| 2021-03-13 12:55:47 | 1 |
| 2021-03-13 12:56:18 | 1 |
| 2021-03-13 12:56:49 | 1 |
| 2021-03-13 12:57:19 | 1 |
| 2021-03-13 12:57:50 | 1 |
| 2021-03-13 12:58:21 | 1 |
| 2021-03-13 12:58:51 | 1 |
| 2021-03-13 12:59:22 | 1 |
| 2021-03-13 12:59:53 | 1 |
| 2021-03-13 13:00:24 | 1 |
| 2021-03-13 13:00:54 | 1 |
| 2021-03-13 13:01:25 | 1 |
| 2021-03-13 13:01:56 | 1 |
| 2021-03-13 13:02:26 | 1 |
| 2021-03-13 13:02:57 | 1 |
| 2021-03-13 13:03:28 | 1 |
| 2021-03-13 13:03:58 | 1 |
| 2021-03-13 13:04:29 | 1 |
| 2021-03-13 13:05:00 | 1 |
| 2021-03-13 13:05:30 | 1 |
| 2021-03-13 13:06:01 | 1 |
| 2021-03-13 13:06:32 | 1 |
| 2021-03-13 13:07:03 | 1 |
| 2021-03-13 13:07:33 | 1 |
| 2021-03-13 13:08:04 | 1 |
| 2021-03-13 13:08:35 | 1 |
| 2021-03-13 13:09:05 | 1 |
| 2021-03-13 13:09:36 | 1 |
| 2021-03-13 13:10:07 | 1 |
| 2021-03-13 13:10:37 | 1 |
| 2021-03-13 13:11:08 | 1 |
| 2021-03-13 13:11:39 | 1 |
| 2021-03-13 13:12:09 | 1 |
| 2021-03-13 13:12:40 | 1 |
| 2021-03-13 13:13:11 | 1 |
| 2021-03-13 13:13:42 | 1 |
| 2021-03-13 13:14:12 | 1 |
| 2021-03-13 13:14:43 | 1 |
| 2021-03-13 13:15:14 | 1 |
| 2021-03-13 13:15:44 | 1 |
| 2021-03-13 13:16:15 | 1 |
| 2021-03-13 13:16:46 | 1 |
| 2021-03-13 13:17:16 | 1 |
| 2021-03-13 13:17:47 | 1 |
| 2021-03-13 13:18:18 | 1 |
| 2021-03-13 13:18:48 | 1 |
| 2021-03-13 13:19:19 | 1 |
| 2021-03-13 13:19:50 | 1 |
| 2021-03-13 13:20:21 | 1 |
| 2021-03-13 13:20:51 | 1 |
| 2021-03-13 13:21:22 | 1 |
| 2021-03-13 13:21:53 | 1 |
| 2021-03-13 13:22:23 | 1 |
| 2021-03-13 13:22:54 | 1 |
| 2021-03-13 13:23:25 | 1 |
| 2021-03-13 13:23:55 | 1 |
| 2021-03-13 13:24:26 | 1 |
| 2021-03-13 13:24:57 | 1 |
| 2021-03-13 13:25:28 | 1 |
| 2021-03-13 13:25:58 | 1 |
| 2021-03-13 13:26:29 | 1 |
| 2021-03-13 13:27:00 | 1 |
| 2021-03-13 13:27:30 | 1 |
| 2021-03-13 13:28:01 | 1 |
| 2021-03-13 13:28:32 | 1 |
| 2021-03-13 13:29:02 | 1 |
| 2021-03-13 13:29:33 | 1 |
| 2021-03-13 13:30:04 | 1 |